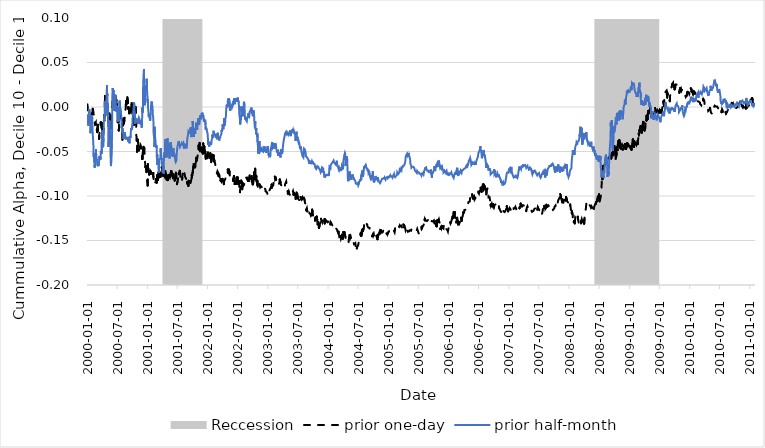
| Category | prior one-day | prior half-month |
|---|---|---|
| 2000-01-03 | 0.003 | -0.008 |
| 2000-01-04 | 0.002 | -0.008 |
| 2000-01-05 | -0.001 | -0.016 |
| 2000-01-06 | -0.013 | -0.012 |
| 2000-01-07 | -0.017 | -0.019 |
| 2000-01-10 | -0.017 | -0.021 |
| 2000-01-11 | -0.016 | -0.022 |
| 2000-01-12 | -0.013 | -0.012 |
| 2000-01-13 | -0.011 | -0.012 |
| 2000-01-14 | -0.014 | -0.002 |
| 2000-01-18 | -0.015 | -0.009 |
| 2000-01-19 | -0.015 | -0.012 |
| 2000-01-20 | -0.014 | -0.02 |
| 2000-01-21 | -0.012 | -0.029 |
| 2000-01-24 | -0.013 | -0.027 |
| 2000-01-25 | -0.012 | -0.023 |
| 2000-01-26 | -0.01 | -0.018 |
| 2000-01-27 | -0.008 | -0.019 |
| 2000-01-28 | -0.01 | -0.019 |
| 2000-01-31 | -0.007 | -0.009 |
| 2000-02-01 | -0.007 | -0.013 |
| 2000-02-02 | -0.006 | -0.02 |
| 2000-02-03 | -0.006 | -0.026 |
| 2000-02-04 | -0.002 | -0.029 |
| 2000-02-07 | -0.004 | -0.039 |
| 2000-02-08 | -0.004 | -0.042 |
| 2000-02-09 | -0.006 | -0.045 |
| 2000-02-10 | -0.009 | -0.056 |
| 2000-02-11 | -0.008 | -0.052 |
| 2000-02-14 | -0.011 | -0.062 |
| 2000-02-15 | -0.014 | -0.064 |
| 2000-02-16 | -0.017 | -0.068 |
| 2000-02-17 | -0.019 | -0.065 |
| 2000-02-18 | -0.018 | -0.067 |
| 2000-02-22 | -0.019 | -0.062 |
| 2000-02-23 | -0.017 | -0.052 |
| 2000-02-24 | -0.022 | -0.047 |
| 2000-02-25 | -0.022 | -0.054 |
| 2000-02-28 | -0.02 | -0.06 |
| 2000-02-29 | -0.026 | -0.06 |
| 2000-03-01 | -0.025 | -0.058 |
| 2000-03-02 | -0.028 | -0.06 |
| 2000-03-03 | -0.026 | -0.061 |
| 2000-03-06 | -0.02 | -0.067 |
| 2000-03-07 | -0.03 | -0.065 |
| 2000-03-08 | -0.03 | -0.065 |
| 2000-03-09 | -0.03 | -0.064 |
| 2000-03-10 | -0.031 | -0.066 |
| 2000-03-13 | -0.031 | -0.063 |
| 2000-03-14 | -0.036 | -0.061 |
| 2000-03-15 | -0.032 | -0.061 |
| 2000-03-16 | -0.033 | -0.055 |
| 2000-03-17 | -0.024 | -0.059 |
| 2000-03-20 | -0.025 | -0.056 |
| 2000-03-21 | -0.022 | -0.057 |
| 2000-03-22 | -0.019 | -0.059 |
| 2000-03-23 | -0.019 | -0.055 |
| 2000-03-24 | -0.017 | -0.049 |
| 2000-03-27 | -0.018 | -0.05 |
| 2000-03-28 | -0.018 | -0.051 |
| 2000-03-29 | -0.023 | -0.053 |
| 2000-03-30 | -0.03 | -0.039 |
| 2000-03-31 | -0.032 | -0.036 |
| 2000-04-03 | -0.022 | -0.026 |
| 2000-04-04 | -0.018 | -0.029 |
| 2000-04-05 | -0.019 | -0.039 |
| 2000-04-06 | -0.022 | -0.042 |
| 2000-04-07 | -0.031 | -0.045 |
| 2000-04-10 | -0.022 | -0.035 |
| 2000-04-11 | -0.019 | -0.025 |
| 2000-04-12 | -0.013 | -0.014 |
| 2000-04-13 | -0.013 | -0.016 |
| 2000-04-14 | -0.015 | -0.012 |
| 2000-04-17 | -0.002 | -0.008 |
| 2000-04-18 | 0.012 | 0.006 |
| 2000-04-19 | 0.009 | 0.002 |
| 2000-04-20 | 0.001 | 0.001 |
| 2000-04-24 | -0.007 | -0.009 |
| 2000-04-25 | 0.005 | 0.002 |
| 2000-04-26 | 0.003 | 0.004 |
| 2000-04-27 | 0.009 | 0.009 |
| 2000-04-28 | 0.016 | 0.013 |
| 2000-05-01 | 0.02 | 0.025 |
| 2000-05-02 | 0.01 | 0.003 |
| 2000-05-03 | 0.006 | -0.005 |
| 2000-05-04 | 0.003 | 0 |
| 2000-05-05 | -0.001 | 0.004 |
| 2000-05-08 | -0.007 | -0.011 |
| 2000-05-09 | -0.012 | -0.023 |
| 2000-05-10 | -0.021 | -0.045 |
| 2000-05-11 | -0.02 | -0.037 |
| 2000-05-12 | -0.014 | -0.028 |
| 2000-05-15 | -0.007 | -0.026 |
| 2000-05-16 | -0.007 | -0.015 |
| 2000-05-17 | -0.01 | -0.017 |
| 2000-05-18 | -0.009 | -0.024 |
| 2000-05-19 | -0.016 | -0.036 |
| 2000-05-22 | -0.02 | -0.043 |
| 2000-05-23 | -0.024 | -0.062 |
| 2000-05-24 | -0.023 | -0.062 |
| 2000-05-25 | -0.015 | -0.066 |
| 2000-05-26 | -0.016 | -0.066 |
| 2000-05-30 | -0.007 | -0.041 |
| 2000-05-31 | -0.002 | -0.036 |
| 2000-06-01 | 0.002 | -0.021 |
| 2000-06-02 | 0.007 | 0.013 |
| 2000-06-05 | 0.006 | 0.021 |
| 2000-06-06 | 0.007 | 0.014 |
| 2000-06-07 | 0.01 | 0.016 |
| 2000-06-08 | 0.01 | 0.015 |
| 2000-06-09 | 0.006 | 0.019 |
| 2000-06-12 | 0.01 | 0.005 |
| 2000-06-13 | 0.012 | 0.005 |
| 2000-06-14 | 0.01 | -0.004 |
| 2000-06-15 | 0.003 | -0.005 |
| 2000-06-16 | -0.003 | -0.004 |
| 2000-06-19 | 0.009 | 0.012 |
| 2000-06-20 | 0.011 | 0.014 |
| 2000-06-21 | 0.012 | 0.015 |
| 2000-06-22 | 0.009 | 0.008 |
| 2000-06-23 | 0.004 | -0.001 |
| 2000-06-26 | 0.008 | 0 |
| 2000-06-27 | 0.001 | -0.005 |
| 2000-06-28 | 0.003 | 0.001 |
| 2000-06-29 | -0.002 | -0.004 |
| 2000-06-30 | -0.002 | -0.006 |
| 2000-07-03 | -0.004 | -0.004 |
| 2000-07-05 | -0.017 | -0.017 |
| 2000-07-06 | -0.015 | -0.014 |
| 2000-07-07 | -0.011 | -0.004 |
| 2000-07-10 | -0.019 | -0.005 |
| 2000-07-11 | -0.026 | -0.014 |
| 2000-07-12 | -0.024 | -0.009 |
| 2000-07-13 | -0.016 | -0.002 |
| 2000-07-14 | -0.01 | 0.006 |
| 2000-07-17 | -0.008 | 0.007 |
| 2000-07-18 | -0.012 | 0.004 |
| 2000-07-19 | -0.012 | 0 |
| 2000-07-20 | -0.007 | 0.001 |
| 2000-07-21 | -0.009 | 0 |
| 2000-07-24 | -0.011 | -0.004 |
| 2000-07-25 | -0.01 | -0.004 |
| 2000-07-26 | -0.013 | -0.01 |
| 2000-07-27 | -0.016 | -0.017 |
| 2000-07-28 | -0.021 | -0.024 |
| 2000-07-31 | -0.024 | -0.023 |
| 2000-08-01 | -0.031 | -0.025 |
| 2000-08-02 | -0.037 | -0.029 |
| 2000-08-03 | -0.027 | -0.024 |
| 2000-08-04 | -0.023 | -0.028 |
| 2000-08-07 | -0.018 | -0.03 |
| 2000-08-08 | -0.013 | -0.029 |
| 2000-08-09 | -0.014 | -0.036 |
| 2000-08-10 | -0.017 | -0.036 |
| 2000-08-11 | -0.019 | -0.037 |
| 2000-08-14 | -0.016 | -0.033 |
| 2000-08-15 | -0.014 | -0.028 |
| 2000-08-16 | -0.015 | -0.031 |
| 2000-08-17 | -0.009 | -0.029 |
| 2000-08-18 | -0.006 | -0.03 |
| 2000-08-21 | -0.005 | -0.034 |
| 2000-08-22 | -0.002 | -0.034 |
| 2000-08-23 | 0.003 | -0.036 |
| 2000-08-24 | 0.007 | -0.036 |
| 2000-08-25 | 0.002 | -0.034 |
| 2000-08-28 | 0.005 | -0.033 |
| 2000-08-29 | 0.005 | -0.034 |
| 2000-08-30 | 0.004 | -0.034 |
| 2000-08-31 | 0.01 | -0.034 |
| 2000-09-01 | 0.011 | -0.034 |
| 2000-09-05 | 0.006 | -0.034 |
| 2000-09-06 | -0.002 | -0.033 |
| 2000-09-07 | 0 | -0.039 |
| 2000-09-08 | -0.002 | -0.038 |
| 2000-09-11 | -0.003 | -0.034 |
| 2000-09-12 | -0.007 | -0.036 |
| 2000-09-13 | -0.008 | -0.038 |
| 2000-09-14 | -0.007 | -0.041 |
| 2000-09-15 | -0.003 | -0.036 |
| 2000-09-18 | -0.002 | -0.033 |
| 2000-09-19 | -0.005 | -0.032 |
| 2000-09-20 | -0.003 | -0.035 |
| 2000-09-21 | -0.004 | -0.032 |
| 2000-09-22 | -0.005 | -0.028 |
| 2000-09-25 | -0.002 | -0.024 |
| 2000-09-26 | 0.003 | -0.025 |
| 2000-09-27 | 0.004 | -0.024 |
| 2000-09-28 | -0.003 | -0.025 |
| 2000-09-29 | -0.001 | -0.025 |
| 2000-10-02 | -0.006 | -0.02 |
| 2000-10-03 | -0.008 | -0.012 |
| 2000-10-04 | -0.004 | -0.013 |
| 2000-10-05 | -0.007 | -0.009 |
| 2000-10-06 | -0.011 | -0.007 |
| 2000-10-09 | -0.012 | -0.007 |
| 2000-10-10 | -0.015 | 0 |
| 2000-10-11 | -0.02 | -0.001 |
| 2000-10-12 | -0.018 | 0.005 |
| 2000-10-13 | -0.011 | -0.003 |
| 2000-10-16 | -0.01 | -0.006 |
| 2000-10-17 | -0.012 | -0.008 |
| 2000-10-18 | -0.019 | -0.012 |
| 2000-10-19 | -0.011 | -0.019 |
| 2000-10-20 | 0 | -0.013 |
| 2000-10-23 | -0.006 | -0.014 |
| 2000-10-24 | -0.014 | -0.015 |
| 2000-10-25 | -0.032 | -0.014 |
| 2000-10-26 | -0.033 | -0.015 |
| 2000-10-27 | -0.038 | -0.015 |
| 2000-10-30 | -0.05 | -0.017 |
| 2000-10-31 | -0.042 | -0.016 |
| 2000-11-01 | -0.037 | -0.013 |
| 2000-11-02 | -0.039 | -0.015 |
| 2000-11-03 | -0.037 | -0.018 |
| 2000-11-06 | -0.041 | -0.019 |
| 2000-11-07 | -0.041 | -0.019 |
| 2000-11-08 | -0.046 | -0.013 |
| 2000-11-09 | -0.045 | -0.014 |
| 2000-11-10 | -0.049 | -0.012 |
| 2000-11-13 | -0.047 | -0.013 |
| 2000-11-14 | -0.045 | -0.019 |
| 2000-11-15 | -0.046 | -0.016 |
| 2000-11-16 | -0.046 | -0.017 |
| 2000-11-17 | -0.047 | -0.015 |
| 2000-11-20 | -0.043 | -0.016 |
| 2000-11-21 | -0.044 | -0.017 |
| 2000-11-22 | -0.043 | -0.019 |
| 2000-11-24 | -0.046 | -0.017 |
| 2000-11-27 | -0.054 | -0.018 |
| 2000-11-28 | -0.055 | -0.023 |
| 2000-11-29 | -0.058 | -0.017 |
| 2000-11-30 | -0.056 | -0.01 |
| 2000-12-01 | -0.058 | -0.001 |
| 2000-12-04 | -0.051 | -0.006 |
| 2000-12-05 | -0.052 | 0.019 |
| 2000-12-06 | -0.047 | 0.019 |
| 2000-12-07 | -0.046 | 0.019 |
| 2000-12-08 | -0.045 | 0.036 |
| 2000-12-11 | -0.049 | 0.043 |
| 2000-12-12 | -0.046 | 0.029 |
| 2000-12-13 | -0.051 | 0.011 |
| 2000-12-14 | -0.052 | 0.002 |
| 2000-12-15 | -0.053 | 0.003 |
| 2000-12-18 | -0.064 | 0.005 |
| 2000-12-19 | -0.066 | 0.011 |
| 2000-12-20 | -0.068 | 0.013 |
| 2000-12-21 | -0.067 | 0.013 |
| 2000-12-22 | -0.067 | 0.023 |
| 2000-12-26 | -0.074 | 0.025 |
| 2000-12-27 | -0.075 | 0.028 |
| 2000-12-28 | -0.079 | 0.032 |
| 2000-12-29 | -0.08 | 0.021 |
| 2001-01-02 | -0.088 | 0.007 |
| 2001-01-03 | -0.072 | 0.009 |
| 2001-01-04 | -0.064 | 0.001 |
| 2001-01-05 | -0.068 | -0.002 |
| 2001-01-08 | -0.069 | -0.002 |
| 2001-01-09 | -0.073 | -0.011 |
| 2001-01-10 | -0.076 | -0.009 |
| 2001-01-11 | -0.072 | -0.007 |
| 2001-01-12 | -0.076 | -0.01 |
| 2001-01-16 | -0.072 | -0.009 |
| 2001-01-17 | -0.072 | -0.015 |
| 2001-01-18 | -0.075 | -0.015 |
| 2001-01-19 | -0.072 | -0.013 |
| 2001-01-22 | -0.073 | -0.002 |
| 2001-01-23 | -0.073 | 0 |
| 2001-01-24 | -0.078 | -0.002 |
| 2001-01-25 | -0.078 | 0.004 |
| 2001-01-26 | -0.078 | 0.006 |
| 2001-01-29 | -0.079 | 0.003 |
| 2001-01-30 | -0.078 | 0.002 |
| 2001-01-31 | -0.08 | 0.003 |
| 2001-02-01 | -0.076 | 0 |
| 2001-02-02 | -0.076 | -0.008 |
| 2001-02-05 | -0.074 | -0.012 |
| 2001-02-06 | -0.079 | -0.016 |
| 2001-02-07 | -0.081 | -0.028 |
| 2001-02-08 | -0.084 | -0.031 |
| 2001-02-09 | -0.084 | -0.032 |
| 2001-02-12 | -0.087 | -0.037 |
| 2001-02-13 | -0.088 | -0.045 |
| 2001-02-14 | -0.087 | -0.03 |
| 2001-02-15 | -0.087 | -0.022 |
| 2001-02-16 | -0.085 | -0.033 |
| 2001-02-20 | -0.084 | -0.042 |
| 2001-02-21 | -0.081 | -0.042 |
| 2001-02-22 | -0.081 | -0.046 |
| 2001-02-23 | -0.083 | -0.043 |
| 2001-02-26 | -0.085 | -0.046 |
| 2001-02-27 | -0.082 | -0.056 |
| 2001-02-28 | -0.079 | -0.061 |
| 2001-03-01 | -0.081 | -0.053 |
| 2001-03-02 | -0.077 | -0.065 |
| 2001-03-05 | -0.077 | -0.063 |
| 2001-03-06 | -0.082 | -0.058 |
| 2001-03-07 | -0.08 | -0.058 |
| 2001-03-08 | -0.078 | -0.063 |
| 2001-03-09 | -0.073 | -0.069 |
| 2001-03-12 | -0.073 | -0.074 |
| 2001-03-13 | -0.079 | -0.06 |
| 2001-03-14 | -0.077 | -0.06 |
| 2001-03-15 | -0.075 | -0.06 |
| 2001-03-16 | -0.074 | -0.06 |
| 2001-03-19 | -0.075 | -0.058 |
| 2001-03-20 | -0.077 | -0.059 |
| 2001-03-21 | -0.078 | -0.055 |
| 2001-03-22 | -0.08 | -0.046 |
| 2001-03-23 | -0.075 | -0.05 |
| 2001-03-26 | -0.074 | -0.056 |
| 2001-03-27 | -0.073 | -0.059 |
| 2001-03-28 | -0.071 | -0.057 |
| 2001-03-29 | -0.067 | -0.06 |
| 2001-03-30 | -0.071 | -0.064 |
| 2001-04-02 | -0.072 | -0.064 |
| 2001-04-03 | -0.07 | -0.068 |
| 2001-04-04 | -0.074 | -0.074 |
| 2001-04-05 | -0.077 | -0.065 |
| 2001-04-06 | -0.073 | -0.07 |
| 2001-04-09 | -0.074 | -0.075 |
| 2001-04-10 | -0.077 | -0.066 |
| 2001-04-11 | -0.077 | -0.055 |
| 2001-04-12 | -0.076 | -0.051 |
| 2001-04-16 | -0.077 | -0.057 |
| 2001-04-17 | -0.079 | -0.057 |
| 2001-04-18 | -0.074 | -0.04 |
| 2001-04-19 | -0.072 | -0.036 |
| 2001-04-20 | -0.072 | -0.038 |
| 2001-04-23 | -0.077 | -0.048 |
| 2001-04-24 | -0.077 | -0.051 |
| 2001-04-25 | -0.076 | -0.056 |
| 2001-04-26 | -0.078 | -0.057 |
| 2001-04-27 | -0.077 | -0.053 |
| 2001-04-30 | -0.08 | -0.055 |
| 2001-05-01 | -0.082 | -0.051 |
| 2001-05-02 | -0.082 | -0.035 |
| 2001-05-03 | -0.077 | -0.04 |
| 2001-05-04 | -0.082 | -0.043 |
| 2001-05-07 | -0.079 | -0.043 |
| 2001-05-08 | -0.08 | -0.041 |
| 2001-05-09 | -0.08 | -0.05 |
| 2001-05-10 | -0.076 | -0.049 |
| 2001-05-11 | -0.075 | -0.048 |
| 2001-05-14 | -0.076 | -0.055 |
| 2001-05-15 | -0.077 | -0.058 |
| 2001-05-16 | -0.079 | -0.05 |
| 2001-05-17 | -0.077 | -0.045 |
| 2001-05-18 | -0.079 | -0.05 |
| 2001-05-21 | -0.077 | -0.04 |
| 2001-05-22 | -0.074 | -0.039 |
| 2001-05-23 | -0.076 | -0.041 |
| 2001-05-24 | -0.074 | -0.041 |
| 2001-05-25 | -0.072 | -0.042 |
| 2001-05-29 | -0.075 | -0.048 |
| 2001-05-30 | -0.077 | -0.055 |
| 2001-05-31 | -0.077 | -0.054 |
| 2001-06-01 | -0.078 | -0.051 |
| 2001-06-04 | -0.08 | -0.056 |
| 2001-06-05 | -0.08 | -0.055 |
| 2001-06-06 | -0.078 | -0.05 |
| 2001-06-07 | -0.075 | -0.046 |
| 2001-06-08 | -0.077 | -0.05 |
| 2001-06-11 | -0.077 | -0.052 |
| 2001-06-12 | -0.078 | -0.055 |
| 2001-06-13 | -0.081 | -0.053 |
| 2001-06-14 | -0.082 | -0.055 |
| 2001-06-15 | -0.083 | -0.056 |
| 2001-06-18 | -0.08 | -0.058 |
| 2001-06-19 | -0.078 | -0.06 |
| 2001-06-20 | -0.079 | -0.06 |
| 2001-06-21 | -0.075 | -0.062 |
| 2001-06-22 | -0.074 | -0.062 |
| 2001-06-25 | -0.075 | -0.061 |
| 2001-06-26 | -0.078 | -0.06 |
| 2001-06-27 | -0.08 | -0.054 |
| 2001-06-28 | -0.081 | -0.053 |
| 2001-06-29 | -0.087 | -0.049 |
| 2001-07-02 | -0.084 | -0.044 |
| 2001-07-03 | -0.085 | -0.043 |
| 2001-07-05 | -0.081 | -0.042 |
| 2001-07-06 | -0.077 | -0.041 |
| 2001-07-09 | -0.076 | -0.041 |
| 2001-07-10 | -0.074 | -0.038 |
| 2001-07-11 | -0.075 | -0.04 |
| 2001-07-12 | -0.076 | -0.042 |
| 2001-07-13 | -0.075 | -0.043 |
| 2001-07-16 | -0.072 | -0.041 |
| 2001-07-17 | -0.074 | -0.045 |
| 2001-07-18 | -0.074 | -0.044 |
| 2001-07-19 | -0.075 | -0.046 |
| 2001-07-20 | -0.079 | -0.043 |
| 2001-07-23 | -0.079 | -0.042 |
| 2001-07-24 | -0.077 | -0.043 |
| 2001-07-25 | -0.077 | -0.041 |
| 2001-07-26 | -0.079 | -0.041 |
| 2001-07-27 | -0.081 | -0.041 |
| 2001-07-30 | -0.082 | -0.042 |
| 2001-07-31 | -0.079 | -0.043 |
| 2001-08-01 | -0.077 | -0.042 |
| 2001-08-02 | -0.073 | -0.042 |
| 2001-08-03 | -0.074 | -0.041 |
| 2001-08-06 | -0.073 | -0.04 |
| 2001-08-07 | -0.072 | -0.043 |
| 2001-08-08 | -0.071 | -0.044 |
| 2001-08-09 | -0.07 | -0.046 |
| 2001-08-10 | -0.071 | -0.047 |
| 2001-08-13 | -0.072 | -0.046 |
| 2001-08-14 | -0.075 | -0.044 |
| 2001-08-15 | -0.076 | -0.043 |
| 2001-08-16 | -0.077 | -0.042 |
| 2001-08-17 | -0.078 | -0.041 |
| 2001-08-20 | -0.077 | -0.041 |
| 2001-08-21 | -0.078 | -0.041 |
| 2001-08-22 | -0.079 | -0.042 |
| 2001-08-23 | -0.08 | -0.043 |
| 2001-08-24 | -0.081 | -0.046 |
| 2001-08-27 | -0.083 | -0.047 |
| 2001-08-28 | -0.083 | -0.043 |
| 2001-08-29 | -0.085 | -0.04 |
| 2001-08-30 | -0.086 | -0.037 |
| 2001-08-31 | -0.084 | -0.035 |
| 2001-09-04 | -0.085 | -0.031 |
| 2001-09-05 | -0.085 | -0.031 |
| 2001-09-06 | -0.088 | -0.028 |
| 2001-09-07 | -0.087 | -0.027 |
| 2001-09-10 | -0.083 | -0.029 |
| 2001-09-17 | -0.084 | -0.028 |
| 2001-09-18 | -0.085 | -0.024 |
| 2001-09-19 | -0.085 | -0.026 |
| 2001-09-20 | -0.083 | -0.024 |
| 2001-09-21 | -0.082 | -0.022 |
| 2001-09-24 | -0.082 | -0.034 |
| 2001-09-25 | -0.081 | -0.033 |
| 2001-09-26 | -0.076 | -0.031 |
| 2001-09-27 | -0.076 | -0.029 |
| 2001-09-28 | -0.079 | -0.025 |
| 2001-10-01 | -0.074 | -0.027 |
| 2001-10-02 | -0.074 | -0.026 |
| 2001-10-03 | -0.072 | -0.016 |
| 2001-10-04 | -0.073 | -0.025 |
| 2001-10-05 | -0.068 | -0.026 |
| 2001-10-08 | -0.064 | -0.025 |
| 2001-10-09 | -0.068 | -0.034 |
| 2001-10-10 | -0.068 | -0.034 |
| 2001-10-11 | -0.068 | -0.027 |
| 2001-10-12 | -0.065 | -0.028 |
| 2001-10-15 | -0.066 | -0.024 |
| 2001-10-16 | -0.065 | -0.025 |
| 2001-10-17 | -0.068 | -0.03 |
| 2001-10-18 | -0.065 | -0.026 |
| 2001-10-19 | -0.065 | -0.026 |
| 2001-10-22 | -0.061 | -0.02 |
| 2001-10-23 | -0.057 | -0.018 |
| 2001-10-24 | -0.061 | -0.02 |
| 2001-10-25 | -0.06 | -0.022 |
| 2001-10-26 | -0.06 | -0.024 |
| 2001-10-29 | -0.058 | -0.026 |
| 2001-10-30 | -0.058 | -0.023 |
| 2001-10-31 | -0.058 | -0.022 |
| 2001-11-01 | -0.055 | -0.021 |
| 2001-11-02 | -0.053 | -0.017 |
| 2001-11-05 | -0.051 | -0.014 |
| 2001-11-06 | -0.048 | -0.012 |
| 2001-11-07 | -0.043 | -0.014 |
| 2001-11-08 | -0.048 | -0.018 |
| 2001-11-09 | -0.046 | -0.02 |
| 2001-11-12 | -0.044 | -0.018 |
| 2001-11-13 | -0.04 | -0.018 |
| 2001-11-14 | -0.042 | -0.015 |
| 2001-11-15 | -0.046 | -0.011 |
| 2001-11-16 | -0.05 | -0.012 |
| 2001-11-19 | -0.046 | -0.009 |
| 2001-11-20 | -0.049 | -0.014 |
| 2001-11-21 | -0.05 | -0.011 |
| 2001-11-23 | -0.048 | -0.012 |
| 2001-11-26 | -0.046 | -0.007 |
| 2001-11-27 | -0.046 | -0.007 |
| 2001-11-28 | -0.051 | -0.009 |
| 2001-11-29 | -0.047 | -0.006 |
| 2001-11-30 | -0.048 | -0.006 |
| 2001-12-03 | -0.052 | -0.011 |
| 2001-12-04 | -0.049 | -0.011 |
| 2001-12-05 | -0.041 | -0.009 |
| 2001-12-06 | -0.041 | -0.009 |
| 2001-12-07 | -0.045 | -0.014 |
| 2001-12-10 | -0.047 | -0.017 |
| 2001-12-11 | -0.044 | -0.014 |
| 2001-12-12 | -0.043 | -0.013 |
| 2001-12-13 | -0.049 | -0.017 |
| 2001-12-14 | -0.052 | -0.018 |
| 2001-12-17 | -0.05 | -0.015 |
| 2001-12-18 | -0.049 | -0.016 |
| 2001-12-19 | -0.052 | -0.02 |
| 2001-12-20 | -0.058 | -0.025 |
| 2001-12-21 | -0.054 | -0.023 |
| 2001-12-24 | -0.054 | -0.023 |
| 2001-12-26 | -0.054 | -0.025 |
| 2001-12-27 | -0.055 | -0.027 |
| 2001-12-28 | -0.055 | -0.026 |
| 2001-12-31 | -0.057 | -0.029 |
| 2002-01-02 | -0.055 | -0.033 |
| 2002-01-03 | -0.051 | -0.041 |
| 2002-01-04 | -0.05 | -0.043 |
| 2002-01-07 | -0.05 | -0.04 |
| 2002-01-08 | -0.05 | -0.042 |
| 2002-01-09 | -0.048 | -0.043 |
| 2002-01-10 | -0.05 | -0.045 |
| 2002-01-11 | -0.051 | -0.042 |
| 2002-01-14 | -0.052 | -0.039 |
| 2002-01-15 | -0.051 | -0.042 |
| 2002-01-16 | -0.057 | -0.041 |
| 2002-01-17 | -0.052 | -0.042 |
| 2002-01-18 | -0.056 | -0.042 |
| 2002-01-22 | -0.062 | -0.042 |
| 2002-01-23 | -0.06 | -0.041 |
| 2002-01-24 | -0.056 | -0.041 |
| 2002-01-25 | -0.058 | -0.037 |
| 2002-01-28 | -0.055 | -0.036 |
| 2002-01-29 | -0.054 | -0.031 |
| 2002-01-30 | -0.054 | -0.033 |
| 2002-01-31 | -0.054 | -0.032 |
| 2002-02-01 | -0.056 | -0.034 |
| 2002-02-04 | -0.058 | -0.032 |
| 2002-02-05 | -0.054 | -0.029 |
| 2002-02-06 | -0.055 | -0.027 |
| 2002-02-07 | -0.061 | -0.031 |
| 2002-02-08 | -0.059 | -0.032 |
| 2002-02-11 | -0.06 | -0.031 |
| 2002-02-12 | -0.061 | -0.032 |
| 2002-02-13 | -0.06 | -0.032 |
| 2002-02-14 | -0.061 | -0.031 |
| 2002-02-15 | -0.063 | -0.031 |
| 2002-02-19 | -0.068 | -0.031 |
| 2002-02-20 | -0.068 | -0.035 |
| 2002-02-21 | -0.07 | -0.03 |
| 2002-02-22 | -0.073 | -0.032 |
| 2002-02-25 | -0.072 | -0.033 |
| 2002-02-26 | -0.074 | -0.033 |
| 2002-02-27 | -0.075 | -0.036 |
| 2002-02-28 | -0.075 | -0.034 |
| 2002-03-01 | -0.072 | -0.031 |
| 2002-03-04 | -0.073 | -0.029 |
| 2002-03-05 | -0.073 | -0.029 |
| 2002-03-06 | -0.074 | -0.034 |
| 2002-03-07 | -0.077 | -0.036 |
| 2002-03-08 | -0.075 | -0.034 |
| 2002-03-11 | -0.074 | -0.036 |
| 2002-03-12 | -0.076 | -0.038 |
| 2002-03-13 | -0.077 | -0.037 |
| 2002-03-14 | -0.079 | -0.037 |
| 2002-03-15 | -0.079 | -0.036 |
| 2002-03-18 | -0.079 | -0.034 |
| 2002-03-19 | -0.08 | -0.033 |
| 2002-03-20 | -0.083 | -0.032 |
| 2002-03-21 | -0.081 | -0.033 |
| 2002-03-22 | -0.08 | -0.032 |
| 2002-03-25 | -0.082 | -0.03 |
| 2002-03-26 | -0.084 | -0.031 |
| 2002-03-27 | -0.084 | -0.026 |
| 2002-03-28 | -0.083 | -0.028 |
| 2002-04-01 | -0.081 | -0.024 |
| 2002-04-02 | -0.083 | -0.019 |
| 2002-04-03 | -0.082 | -0.022 |
| 2002-04-04 | -0.082 | -0.024 |
| 2002-04-05 | -0.084 | -0.025 |
| 2002-04-08 | -0.084 | -0.023 |
| 2002-04-09 | -0.087 | -0.024 |
| 2002-04-10 | -0.086 | -0.02 |
| 2002-04-11 | -0.083 | -0.012 |
| 2002-04-12 | -0.083 | -0.021 |
| 2002-04-15 | -0.082 | -0.018 |
| 2002-04-16 | -0.083 | -0.02 |
| 2002-04-17 | -0.083 | -0.016 |
| 2002-04-18 | -0.081 | -0.014 |
| 2002-04-19 | -0.08 | -0.013 |
| 2002-04-22 | -0.079 | -0.01 |
| 2002-04-23 | -0.079 | -0.004 |
| 2002-04-24 | -0.078 | -0.004 |
| 2002-04-25 | -0.078 | -0.004 |
| 2002-04-26 | -0.078 | 0.003 |
| 2002-04-29 | -0.079 | 0.001 |
| 2002-04-30 | -0.079 | -0.001 |
| 2002-05-01 | -0.077 | -0.001 |
| 2002-05-02 | -0.073 | 0.002 |
| 2002-05-03 | -0.07 | 0.007 |
| 2002-05-06 | -0.07 | 0.007 |
| 2002-05-07 | -0.071 | 0.01 |
| 2002-05-08 | -0.075 | 0.001 |
| 2002-05-09 | -0.073 | 0.004 |
| 2002-05-10 | -0.07 | 0.009 |
| 2002-05-13 | -0.07 | 0.006 |
| 2002-05-14 | -0.073 | 0.001 |
| 2002-05-15 | -0.078 | -0.002 |
| 2002-05-16 | -0.078 | -0.002 |
| 2002-05-17 | -0.077 | -0.004 |
| 2002-05-20 | -0.078 | -0.002 |
| 2002-05-21 | -0.079 | 0 |
| 2002-05-22 | -0.081 | 0 |
| 2002-05-23 | -0.081 | 0.002 |
| 2002-05-24 | -0.082 | 0.001 |
| 2002-05-28 | -0.082 | 0.002 |
| 2002-05-29 | -0.082 | 0 |
| 2002-05-30 | -0.082 | -0.001 |
| 2002-05-31 | -0.081 | 0.001 |
| 2002-06-03 | -0.082 | 0.002 |
| 2002-06-04 | -0.083 | 0.002 |
| 2002-06-05 | -0.081 | 0.007 |
| 2002-06-06 | -0.081 | 0.007 |
| 2002-06-07 | -0.079 | 0.005 |
| 2002-06-10 | -0.077 | 0.008 |
| 2002-06-11 | -0.081 | 0.01 |
| 2002-06-12 | -0.084 | 0.006 |
| 2002-06-13 | -0.086 | 0.005 |
| 2002-06-14 | -0.086 | 0.003 |
| 2002-06-17 | -0.084 | 0.008 |
| 2002-06-18 | -0.086 | 0.007 |
| 2002-06-19 | -0.087 | 0.01 |
| 2002-06-20 | -0.084 | 0.008 |
| 2002-06-21 | -0.084 | 0.006 |
| 2002-06-24 | -0.082 | 0.009 |
| 2002-06-25 | -0.081 | 0.006 |
| 2002-06-26 | -0.079 | 0.01 |
| 2002-06-27 | -0.08 | 0.009 |
| 2002-06-28 | -0.087 | 0.006 |
| 2002-07-01 | -0.081 | 0.009 |
| 2002-07-02 | -0.079 | 0.011 |
| 2002-07-03 | -0.082 | 0.006 |
| 2002-07-05 | -0.086 | 0.007 |
| 2002-07-08 | -0.085 | 0.005 |
| 2002-07-09 | -0.083 | 0.005 |
| 2002-07-10 | -0.084 | 0.005 |
| 2002-07-11 | -0.087 | -0.004 |
| 2002-07-12 | -0.091 | -0.008 |
| 2002-07-15 | -0.091 | -0.013 |
| 2002-07-16 | -0.096 | -0.018 |
| 2002-07-17 | -0.093 | -0.02 |
| 2002-07-18 | -0.094 | -0.019 |
| 2002-07-19 | -0.092 | -0.017 |
| 2002-07-22 | -0.089 | -0.014 |
| 2002-07-23 | -0.083 | -0.007 |
| 2002-07-24 | -0.084 | 0.001 |
| 2002-07-25 | -0.086 | -0.005 |
| 2002-07-26 | -0.084 | -0.004 |
| 2002-07-29 | -0.09 | -0.001 |
| 2002-07-30 | -0.092 | -0.007 |
| 2002-07-31 | -0.085 | -0.009 |
| 2002-08-01 | -0.089 | 0 |
| 2002-08-02 | -0.089 | -0.01 |
| 2002-08-05 | -0.088 | -0.005 |
| 2002-08-06 | -0.088 | -0.003 |
| 2002-08-07 | -0.089 | 0.001 |
| 2002-08-08 | -0.088 | 0.002 |
| 2002-08-09 | -0.087 | 0.006 |
| 2002-08-12 | -0.088 | 0.002 |
| 2002-08-13 | -0.087 | 0.003 |
| 2002-08-14 | -0.085 | -0.008 |
| 2002-08-15 | -0.085 | -0.012 |
| 2002-08-16 | -0.082 | -0.014 |
| 2002-08-19 | -0.08 | -0.012 |
| 2002-08-20 | -0.079 | -0.011 |
| 2002-08-21 | -0.078 | -0.014 |
| 2002-08-22 | -0.078 | -0.015 |
| 2002-08-23 | -0.079 | -0.015 |
| 2002-08-26 | -0.079 | -0.016 |
| 2002-08-27 | -0.081 | -0.015 |
| 2002-08-28 | -0.082 | -0.016 |
| 2002-08-29 | -0.079 | -0.012 |
| 2002-08-30 | -0.081 | -0.011 |
| 2002-09-03 | -0.082 | -0.01 |
| 2002-09-04 | -0.083 | -0.012 |
| 2002-09-05 | -0.082 | -0.007 |
| 2002-09-06 | -0.083 | -0.009 |
| 2002-09-09 | -0.08 | -0.008 |
| 2002-09-10 | -0.078 | -0.01 |
| 2002-09-11 | -0.077 | -0.008 |
| 2002-09-12 | -0.077 | -0.006 |
| 2002-09-13 | -0.077 | -0.005 |
| 2002-09-16 | -0.076 | -0.005 |
| 2002-09-17 | -0.075 | -0.004 |
| 2002-09-18 | -0.077 | -0.003 |
| 2002-09-19 | -0.079 | -0.004 |
| 2002-09-20 | -0.081 | -0.002 |
| 2002-09-23 | -0.079 | -0.001 |
| 2002-09-24 | -0.078 | 0 |
| 2002-09-25 | -0.082 | -0.007 |
| 2002-09-26 | -0.085 | -0.003 |
| 2002-09-27 | -0.085 | -0.004 |
| 2002-09-30 | -0.087 | -0.005 |
| 2002-10-01 | -0.085 | -0.01 |
| 2002-10-02 | -0.084 | -0.008 |
| 2002-10-03 | -0.087 | -0.005 |
| 2002-10-04 | -0.085 | -0.004 |
| 2002-10-07 | -0.082 | -0.004 |
| 2002-10-08 | -0.08 | -0.006 |
| 2002-10-09 | -0.073 | -0.008 |
| 2002-10-10 | -0.081 | -0.011 |
| 2002-10-11 | -0.081 | -0.016 |
| 2002-10-14 | -0.08 | -0.023 |
| 2002-10-15 | -0.076 | -0.024 |
| 2002-10-16 | -0.069 | -0.016 |
| 2002-10-17 | -0.076 | -0.024 |
| 2002-10-18 | -0.075 | -0.024 |
| 2002-10-21 | -0.081 | -0.026 |
| 2002-10-22 | -0.077 | -0.024 |
| 2002-10-23 | -0.083 | -0.031 |
| 2002-10-24 | -0.083 | -0.031 |
| 2002-10-25 | -0.085 | -0.029 |
| 2002-10-28 | -0.087 | -0.034 |
| 2002-10-29 | -0.083 | -0.029 |
| 2002-10-30 | -0.088 | -0.039 |
| 2002-10-31 | -0.089 | -0.038 |
| 2002-11-01 | -0.089 | -0.042 |
| 2002-11-04 | -0.091 | -0.052 |
| 2002-11-05 | -0.091 | -0.048 |
| 2002-11-06 | -0.092 | -0.053 |
| 2002-11-07 | -0.09 | -0.053 |
| 2002-11-08 | -0.088 | -0.046 |
| 2002-11-11 | -0.087 | -0.038 |
| 2002-11-12 | -0.088 | -0.043 |
| 2002-11-13 | -0.089 | -0.044 |
| 2002-11-14 | -0.089 | -0.045 |
| 2002-11-15 | -0.09 | -0.046 |
| 2002-11-18 | -0.089 | -0.05 |
| 2002-11-19 | -0.089 | -0.047 |
| 2002-11-20 | -0.088 | -0.049 |
| 2002-11-21 | -0.088 | -0.048 |
| 2002-11-22 | -0.09 | -0.048 |
| 2002-11-25 | -0.09 | -0.047 |
| 2002-11-26 | -0.091 | -0.047 |
| 2002-11-27 | -0.091 | -0.048 |
| 2002-11-29 | -0.092 | -0.049 |
| 2002-12-02 | -0.091 | -0.05 |
| 2002-12-03 | -0.09 | -0.047 |
| 2002-12-04 | -0.092 | -0.051 |
| 2002-12-05 | -0.092 | -0.049 |
| 2002-12-06 | -0.092 | -0.049 |
| 2002-12-09 | -0.093 | -0.044 |
| 2002-12-10 | -0.093 | -0.047 |
| 2002-12-11 | -0.093 | -0.047 |
| 2002-12-12 | -0.091 | -0.047 |
| 2002-12-13 | -0.09 | -0.045 |
| 2002-12-16 | -0.092 | -0.049 |
| 2002-12-17 | -0.093 | -0.05 |
| 2002-12-18 | -0.095 | -0.048 |
| 2002-12-19 | -0.095 | -0.047 |
| 2002-12-20 | -0.095 | -0.048 |
| 2002-12-23 | -0.094 | -0.051 |
| 2002-12-24 | -0.095 | -0.05 |
| 2002-12-26 | -0.096 | -0.049 |
| 2002-12-27 | -0.096 | -0.047 |
| 2002-12-30 | -0.098 | -0.046 |
| 2002-12-31 | -0.099 | -0.044 |
| 2003-01-02 | -0.099 | -0.049 |
| 2003-01-03 | -0.1 | -0.05 |
| 2003-01-06 | -0.098 | -0.055 |
| 2003-01-07 | -0.096 | -0.054 |
| 2003-01-08 | -0.096 | -0.052 |
| 2003-01-09 | -0.095 | -0.055 |
| 2003-01-10 | -0.094 | -0.055 |
| 2003-01-13 | -0.094 | -0.053 |
| 2003-01-14 | -0.093 | -0.056 |
| 2003-01-15 | -0.092 | -0.056 |
| 2003-01-16 | -0.092 | -0.053 |
| 2003-01-17 | -0.091 | -0.048 |
| 2003-01-21 | -0.091 | -0.045 |
| 2003-01-22 | -0.09 | -0.045 |
| 2003-01-23 | -0.091 | -0.049 |
| 2003-01-24 | -0.087 | -0.042 |
| 2003-01-27 | -0.087 | -0.039 |
| 2003-01-28 | -0.089 | -0.042 |
| 2003-01-29 | -0.089 | -0.047 |
| 2003-01-30 | -0.089 | -0.043 |
| 2003-01-31 | -0.09 | -0.043 |
| 2003-02-03 | -0.088 | -0.041 |
| 2003-02-04 | -0.083 | -0.044 |
| 2003-02-05 | -0.083 | -0.043 |
| 2003-02-06 | -0.083 | -0.043 |
| 2003-02-07 | -0.082 | -0.045 |
| 2003-02-10 | -0.083 | -0.047 |
| 2003-02-11 | -0.08 | -0.045 |
| 2003-02-12 | -0.078 | -0.041 |
| 2003-02-13 | -0.08 | -0.042 |
| 2003-02-14 | -0.082 | -0.041 |
| 2003-02-18 | -0.082 | -0.041 |
| 2003-02-19 | -0.08 | -0.043 |
| 2003-02-20 | -0.08 | -0.044 |
| 2003-02-21 | -0.083 | -0.047 |
| 2003-02-24 | -0.082 | -0.05 |
| 2003-02-25 | -0.083 | -0.05 |
| 2003-02-26 | -0.083 | -0.05 |
| 2003-02-27 | -0.083 | -0.049 |
| 2003-02-28 | -0.082 | -0.05 |
| 2003-03-03 | -0.083 | -0.049 |
| 2003-03-04 | -0.084 | -0.055 |
| 2003-03-05 | -0.084 | -0.054 |
| 2003-03-06 | -0.085 | -0.056 |
| 2003-03-07 | -0.087 | -0.051 |
| 2003-03-10 | -0.086 | -0.053 |
| 2003-03-11 | -0.086 | -0.053 |
| 2003-03-12 | -0.084 | -0.051 |
| 2003-03-13 | -0.083 | -0.05 |
| 2003-03-14 | -0.081 | -0.051 |
| 2003-03-17 | -0.081 | -0.054 |
| 2003-03-18 | -0.082 | -0.057 |
| 2003-03-19 | -0.084 | -0.052 |
| 2003-03-20 | -0.086 | -0.053 |
| 2003-03-21 | -0.087 | -0.047 |
| 2003-03-24 | -0.088 | -0.048 |
| 2003-03-25 | -0.089 | -0.05 |
| 2003-03-26 | -0.088 | -0.051 |
| 2003-03-27 | -0.09 | -0.053 |
| 2003-03-28 | -0.092 | -0.052 |
| 2003-03-31 | -0.092 | -0.05 |
| 2003-04-01 | -0.092 | -0.05 |
| 2003-04-02 | -0.091 | -0.044 |
| 2003-04-03 | -0.091 | -0.044 |
| 2003-04-04 | -0.09 | -0.042 |
| 2003-04-07 | -0.088 | -0.037 |
| 2003-04-08 | -0.088 | -0.037 |
| 2003-04-09 | -0.089 | -0.037 |
| 2003-04-10 | -0.089 | -0.035 |
| 2003-04-11 | -0.089 | -0.034 |
| 2003-04-14 | -0.088 | -0.034 |
| 2003-04-15 | -0.087 | -0.03 |
| 2003-04-16 | -0.086 | -0.03 |
| 2003-04-17 | -0.086 | -0.029 |
| 2003-04-21 | -0.085 | -0.028 |
| 2003-04-22 | -0.084 | -0.027 |
| 2003-04-23 | -0.083 | -0.027 |
| 2003-04-24 | -0.087 | -0.027 |
| 2003-04-25 | -0.09 | -0.03 |
| 2003-04-28 | -0.09 | -0.029 |
| 2003-04-29 | -0.091 | -0.029 |
| 2003-04-30 | -0.094 | -0.029 |
| 2003-05-01 | -0.095 | -0.03 |
| 2003-05-02 | -0.098 | -0.03 |
| 2003-05-05 | -0.097 | -0.032 |
| 2003-05-06 | -0.097 | -0.032 |
| 2003-05-07 | -0.095 | -0.029 |
| 2003-05-08 | -0.095 | -0.031 |
| 2003-05-09 | -0.096 | -0.03 |
| 2003-05-12 | -0.097 | -0.029 |
| 2003-05-13 | -0.098 | -0.028 |
| 2003-05-14 | -0.099 | -0.029 |
| 2003-05-15 | -0.099 | -0.028 |
| 2003-05-16 | -0.099 | -0.026 |
| 2003-05-19 | -0.099 | -0.031 |
| 2003-05-20 | -0.099 | -0.033 |
| 2003-05-21 | -0.096 | -0.031 |
| 2003-05-22 | -0.097 | -0.03 |
| 2003-05-23 | -0.096 | -0.03 |
| 2003-05-27 | -0.097 | -0.03 |
| 2003-05-28 | -0.098 | -0.028 |
| 2003-05-29 | -0.097 | -0.025 |
| 2003-05-30 | -0.098 | -0.027 |
| 2003-06-02 | -0.095 | -0.025 |
| 2003-06-03 | -0.096 | -0.025 |
| 2003-06-04 | -0.096 | -0.025 |
| 2003-06-05 | -0.098 | -0.028 |
| 2003-06-06 | -0.098 | -0.03 |
| 2003-06-09 | -0.097 | -0.028 |
| 2003-06-10 | -0.097 | -0.028 |
| 2003-06-11 | -0.097 | -0.03 |
| 2003-06-12 | -0.097 | -0.029 |
| 2003-06-13 | -0.097 | -0.029 |
| 2003-06-16 | -0.099 | -0.032 |
| 2003-06-17 | -0.101 | -0.036 |
| 2003-06-18 | -0.103 | -0.038 |
| 2003-06-19 | -0.101 | -0.033 |
| 2003-06-20 | -0.1 | -0.032 |
| 2003-06-23 | -0.098 | -0.028 |
| 2003-06-24 | -0.096 | -0.027 |
| 2003-06-25 | -0.098 | -0.03 |
| 2003-06-26 | -0.102 | -0.034 |
| 2003-06-27 | -0.102 | -0.035 |
| 2003-06-30 | -0.102 | -0.034 |
| 2003-07-01 | -0.1 | -0.035 |
| 2003-07-02 | -0.102 | -0.038 |
| 2003-07-03 | -0.103 | -0.036 |
| 2003-07-07 | -0.102 | -0.04 |
| 2003-07-08 | -0.104 | -0.042 |
| 2003-07-09 | -0.104 | -0.039 |
| 2003-07-10 | -0.105 | -0.041 |
| 2003-07-11 | -0.104 | -0.041 |
| 2003-07-14 | -0.104 | -0.046 |
| 2003-07-15 | -0.104 | -0.047 |
| 2003-07-16 | -0.105 | -0.046 |
| 2003-07-17 | -0.103 | -0.045 |
| 2003-07-18 | -0.101 | -0.044 |
| 2003-07-21 | -0.101 | -0.044 |
| 2003-07-22 | -0.102 | -0.047 |
| 2003-07-23 | -0.104 | -0.05 |
| 2003-07-24 | -0.105 | -0.05 |
| 2003-07-25 | -0.103 | -0.051 |
| 2003-07-28 | -0.102 | -0.053 |
| 2003-07-29 | -0.104 | -0.055 |
| 2003-07-30 | -0.104 | -0.055 |
| 2003-07-31 | -0.104 | -0.054 |
| 2003-08-01 | -0.104 | -0.054 |
| 2003-08-04 | -0.103 | -0.057 |
| 2003-08-05 | -0.104 | -0.055 |
| 2003-08-06 | -0.102 | -0.051 |
| 2003-08-07 | -0.102 | -0.049 |
| 2003-08-08 | -0.102 | -0.047 |
| 2003-08-11 | -0.103 | -0.046 |
| 2003-08-12 | -0.105 | -0.047 |
| 2003-08-13 | -0.107 | -0.048 |
| 2003-08-14 | -0.107 | -0.049 |
| 2003-08-15 | -0.107 | -0.049 |
| 2003-08-18 | -0.11 | -0.052 |
| 2003-08-19 | -0.113 | -0.056 |
| 2003-08-20 | -0.114 | -0.054 |
| 2003-08-21 | -0.116 | -0.056 |
| 2003-08-22 | -0.115 | -0.056 |
| 2003-08-25 | -0.114 | -0.055 |
| 2003-08-26 | -0.114 | -0.056 |
| 2003-08-27 | -0.116 | -0.057 |
| 2003-08-28 | -0.118 | -0.056 |
| 2003-08-29 | -0.118 | -0.057 |
| 2003-09-02 | -0.12 | -0.059 |
| 2003-09-03 | -0.122 | -0.059 |
| 2003-09-04 | -0.122 | -0.06 |
| 2003-09-05 | -0.121 | -0.061 |
| 2003-09-08 | -0.123 | -0.063 |
| 2003-09-09 | -0.122 | -0.064 |
| 2003-09-10 | -0.119 | -0.061 |
| 2003-09-11 | -0.12 | -0.062 |
| 2003-09-12 | -0.119 | -0.062 |
| 2003-09-15 | -0.119 | -0.062 |
| 2003-09-16 | -0.121 | -0.062 |
| 2003-09-17 | -0.12 | -0.06 |
| 2003-09-18 | -0.122 | -0.062 |
| 2003-09-19 | -0.121 | -0.064 |
| 2003-09-22 | -0.12 | -0.063 |
| 2003-09-23 | -0.122 | -0.062 |
| 2003-09-24 | -0.12 | -0.063 |
| 2003-09-25 | -0.117 | -0.061 |
| 2003-09-26 | -0.115 | -0.061 |
| 2003-09-29 | -0.117 | -0.063 |
| 2003-09-30 | -0.117 | -0.061 |
| 2003-10-01 | -0.121 | -0.064 |
| 2003-10-02 | -0.121 | -0.062 |
| 2003-10-03 | -0.124 | -0.064 |
| 2003-10-06 | -0.124 | -0.064 |
| 2003-10-07 | -0.125 | -0.064 |
| 2003-10-08 | -0.124 | -0.064 |
| 2003-10-09 | -0.125 | -0.065 |
| 2003-10-10 | -0.124 | -0.064 |
| 2003-10-13 | -0.128 | -0.066 |
| 2003-10-14 | -0.129 | -0.067 |
| 2003-10-15 | -0.125 | -0.068 |
| 2003-10-16 | -0.127 | -0.068 |
| 2003-10-17 | -0.124 | -0.069 |
| 2003-10-20 | -0.124 | -0.069 |
| 2003-10-21 | -0.126 | -0.069 |
| 2003-10-22 | -0.125 | -0.068 |
| 2003-10-23 | -0.124 | -0.069 |
| 2003-10-24 | -0.123 | -0.068 |
| 2003-10-27 | -0.127 | -0.066 |
| 2003-10-28 | -0.129 | -0.066 |
| 2003-10-29 | -0.132 | -0.067 |
| 2003-10-30 | -0.131 | -0.067 |
| 2003-10-31 | -0.129 | -0.066 |
| 2003-11-03 | -0.132 | -0.067 |
| 2003-11-04 | -0.133 | -0.067 |
| 2003-11-05 | -0.134 | -0.067 |
| 2003-11-06 | -0.136 | -0.069 |
| 2003-11-07 | -0.136 | -0.069 |
| 2003-11-10 | -0.134 | -0.069 |
| 2003-11-11 | -0.133 | -0.069 |
| 2003-11-12 | -0.134 | -0.069 |
| 2003-11-13 | -0.134 | -0.071 |
| 2003-11-14 | -0.13 | -0.072 |
| 2003-11-17 | -0.127 | -0.074 |
| 2003-11-18 | -0.127 | -0.073 |
| 2003-11-19 | -0.126 | -0.073 |
| 2003-11-20 | -0.126 | -0.072 |
| 2003-11-21 | -0.126 | -0.071 |
| 2003-11-24 | -0.129 | -0.071 |
| 2003-11-25 | -0.129 | -0.068 |
| 2003-11-26 | -0.129 | -0.068 |
| 2003-11-28 | -0.13 | -0.068 |
| 2003-12-01 | -0.131 | -0.068 |
| 2003-12-02 | -0.13 | -0.069 |
| 2003-12-03 | -0.127 | -0.072 |
| 2003-12-04 | -0.127 | -0.074 |
| 2003-12-05 | -0.127 | -0.072 |
| 2003-12-08 | -0.129 | -0.075 |
| 2003-12-09 | -0.127 | -0.077 |
| 2003-12-10 | -0.126 | -0.079 |
| 2003-12-11 | -0.129 | -0.076 |
| 2003-12-12 | -0.131 | -0.076 |
| 2003-12-15 | -0.127 | -0.077 |
| 2003-12-16 | -0.128 | -0.078 |
| 2003-12-17 | -0.129 | -0.078 |
| 2003-12-18 | -0.129 | -0.077 |
| 2003-12-19 | -0.129 | -0.077 |
| 2003-12-22 | -0.129 | -0.076 |
| 2003-12-23 | -0.13 | -0.077 |
| 2003-12-24 | -0.128 | -0.076 |
| 2003-12-26 | -0.128 | -0.075 |
| 2003-12-29 | -0.129 | -0.076 |
| 2003-12-30 | -0.129 | -0.077 |
| 2003-12-31 | -0.129 | -0.078 |
| 2004-01-02 | -0.129 | -0.075 |
| 2004-01-05 | -0.128 | -0.077 |
| 2004-01-06 | -0.129 | -0.075 |
| 2004-01-07 | -0.129 | -0.074 |
| 2004-01-08 | -0.127 | -0.071 |
| 2004-01-09 | -0.128 | -0.067 |
| 2004-01-12 | -0.128 | -0.068 |
| 2004-01-13 | -0.13 | -0.068 |
| 2004-01-14 | -0.132 | -0.068 |
| 2004-01-15 | -0.132 | -0.069 |
| 2004-01-16 | -0.129 | -0.066 |
| 2004-01-20 | -0.13 | -0.065 |
| 2004-01-21 | -0.13 | -0.064 |
| 2004-01-22 | -0.131 | -0.064 |
| 2004-01-23 | -0.131 | -0.064 |
| 2004-01-26 | -0.131 | -0.064 |
| 2004-01-27 | -0.133 | -0.064 |
| 2004-01-28 | -0.135 | -0.062 |
| 2004-01-29 | -0.135 | -0.062 |
| 2004-01-30 | -0.136 | -0.062 |
| 2004-02-02 | -0.136 | -0.062 |
| 2004-02-03 | -0.135 | -0.06 |
| 2004-02-04 | -0.135 | -0.06 |
| 2004-02-05 | -0.136 | -0.062 |
| 2004-02-06 | -0.135 | -0.062 |
| 2004-02-09 | -0.136 | -0.063 |
| 2004-02-10 | -0.136 | -0.063 |
| 2004-02-11 | -0.137 | -0.063 |
| 2004-02-12 | -0.137 | -0.063 |
| 2004-02-13 | -0.136 | -0.063 |
| 2004-02-17 | -0.136 | -0.065 |
| 2004-02-18 | -0.136 | -0.063 |
| 2004-02-19 | -0.137 | -0.063 |
| 2004-02-20 | -0.138 | -0.063 |
| 2004-02-23 | -0.137 | -0.06 |
| 2004-02-24 | -0.137 | -0.063 |
| 2004-02-25 | -0.138 | -0.064 |
| 2004-02-26 | -0.139 | -0.065 |
| 2004-02-27 | -0.14 | -0.066 |
| 2004-03-01 | -0.14 | -0.067 |
| 2004-03-02 | -0.141 | -0.067 |
| 2004-03-03 | -0.142 | -0.067 |
| 2004-03-04 | -0.14 | -0.068 |
| 2004-03-05 | -0.142 | -0.07 |
| 2004-03-08 | -0.144 | -0.068 |
| 2004-03-09 | -0.146 | -0.069 |
| 2004-03-10 | -0.147 | -0.069 |
| 2004-03-11 | -0.146 | -0.069 |
| 2004-03-12 | -0.145 | -0.071 |
| 2004-03-15 | -0.147 | -0.07 |
| 2004-03-16 | -0.146 | -0.07 |
| 2004-03-17 | -0.145 | -0.068 |
| 2004-03-18 | -0.147 | -0.069 |
| 2004-03-19 | -0.148 | -0.072 |
| 2004-03-22 | -0.149 | -0.072 |
| 2004-03-23 | -0.148 | -0.073 |
| 2004-03-24 | -0.146 | -0.069 |
| 2004-03-25 | -0.143 | -0.066 |
| 2004-03-26 | -0.146 | -0.066 |
| 2004-03-29 | -0.145 | -0.066 |
| 2004-03-30 | -0.146 | -0.068 |
| 2004-03-31 | -0.148 | -0.07 |
| 2004-04-01 | -0.144 | -0.068 |
| 2004-04-02 | -0.14 | -0.062 |
| 2004-04-05 | -0.14 | -0.058 |
| 2004-04-06 | -0.141 | -0.057 |
| 2004-04-07 | -0.143 | -0.059 |
| 2004-04-08 | -0.141 | -0.054 |
| 2004-04-12 | -0.141 | -0.052 |
| 2004-04-13 | -0.141 | -0.053 |
| 2004-04-14 | -0.141 | -0.053 |
| 2004-04-15 | -0.146 | -0.059 |
| 2004-04-16 | -0.149 | -0.066 |
| 2004-04-19 | -0.148 | -0.061 |
| 2004-04-20 | -0.148 | -0.063 |
| 2004-04-21 | -0.147 | -0.057 |
| 2004-04-22 | -0.147 | -0.059 |
| 2004-04-23 | -0.147 | -0.056 |
| 2004-04-26 | -0.149 | -0.06 |
| 2004-04-27 | -0.151 | -0.068 |
| 2004-04-28 | -0.151 | -0.071 |
| 2004-04-29 | -0.15 | -0.075 |
| 2004-04-30 | -0.152 | -0.082 |
| 2004-05-03 | -0.152 | -0.083 |
| 2004-05-04 | -0.152 | -0.08 |
| 2004-05-05 | -0.151 | -0.078 |
| 2004-05-06 | -0.151 | -0.079 |
| 2004-05-07 | -0.146 | -0.076 |
| 2004-05-10 | -0.144 | -0.076 |
| 2004-05-11 | -0.143 | -0.072 |
| 2004-05-12 | -0.144 | -0.075 |
| 2004-05-13 | -0.144 | -0.075 |
| 2004-05-14 | -0.147 | -0.08 |
| 2004-05-17 | -0.146 | -0.082 |
| 2004-05-18 | -0.146 | -0.08 |
| 2004-05-19 | -0.147 | -0.077 |
| 2004-05-20 | -0.147 | -0.078 |
| 2004-05-21 | -0.148 | -0.078 |
| 2004-05-24 | -0.15 | -0.079 |
| 2004-05-25 | -0.151 | -0.078 |
| 2004-05-26 | -0.151 | -0.077 |
| 2004-05-27 | -0.151 | -0.076 |
| 2004-05-28 | -0.152 | -0.075 |
| 2004-06-01 | -0.153 | -0.076 |
| 2004-06-02 | -0.154 | -0.079 |
| 2004-06-03 | -0.154 | -0.082 |
| 2004-06-04 | -0.153 | -0.08 |
| 2004-06-07 | -0.154 | -0.079 |
| 2004-06-08 | -0.154 | -0.079 |
| 2004-06-09 | -0.154 | -0.082 |
| 2004-06-10 | -0.154 | -0.081 |
| 2004-06-14 | -0.153 | -0.082 |
| 2004-06-15 | -0.154 | -0.084 |
| 2004-06-16 | -0.155 | -0.086 |
| 2004-06-17 | -0.157 | -0.086 |
| 2004-06-18 | -0.157 | -0.086 |
| 2004-06-21 | -0.156 | -0.086 |
| 2004-06-22 | -0.157 | -0.086 |
| 2004-06-23 | -0.159 | -0.087 |
| 2004-06-24 | -0.158 | -0.087 |
| 2004-06-25 | -0.157 | -0.086 |
| 2004-06-28 | -0.158 | -0.086 |
| 2004-06-29 | -0.157 | -0.085 |
| 2004-06-30 | -0.158 | -0.086 |
| 2004-07-01 | -0.155 | -0.087 |
| 2004-07-02 | -0.154 | -0.088 |
| 2004-07-06 | -0.151 | -0.086 |
| 2004-07-07 | -0.15 | -0.084 |
| 2004-07-08 | -0.147 | -0.084 |
| 2004-07-09 | -0.147 | -0.084 |
| 2004-07-12 | -0.145 | -0.084 |
| 2004-07-13 | -0.145 | -0.082 |
| 2004-07-14 | -0.145 | -0.083 |
| 2004-07-15 | -0.146 | -0.083 |
| 2004-07-16 | -0.142 | -0.081 |
| 2004-07-19 | -0.141 | -0.08 |
| 2004-07-20 | -0.145 | -0.081 |
| 2004-07-21 | -0.141 | -0.076 |
| 2004-07-22 | -0.143 | -0.078 |
| 2004-07-23 | -0.14 | -0.075 |
| 2004-07-26 | -0.138 | -0.071 |
| 2004-07-27 | -0.14 | -0.075 |
| 2004-07-28 | -0.138 | -0.075 |
| 2004-07-29 | -0.139 | -0.076 |
| 2004-07-30 | -0.139 | -0.078 |
| 2004-08-02 | -0.139 | -0.075 |
| 2004-08-03 | -0.137 | -0.074 |
| 2004-08-04 | -0.137 | -0.071 |
| 2004-08-05 | -0.135 | -0.069 |
| 2004-08-06 | -0.133 | -0.066 |
| 2004-08-09 | -0.133 | -0.068 |
| 2004-08-10 | -0.134 | -0.068 |
| 2004-08-11 | -0.132 | -0.067 |
| 2004-08-12 | -0.129 | -0.066 |
| 2004-08-13 | -0.13 | -0.066 |
| 2004-08-16 | -0.13 | -0.065 |
| 2004-08-17 | -0.13 | -0.065 |
| 2004-08-18 | -0.13 | -0.067 |
| 2004-08-19 | -0.131 | -0.068 |
| 2004-08-20 | -0.131 | -0.069 |
| 2004-08-23 | -0.132 | -0.068 |
| 2004-08-24 | -0.131 | -0.068 |
| 2004-08-25 | -0.132 | -0.069 |
| 2004-08-26 | -0.134 | -0.069 |
| 2004-08-27 | -0.133 | -0.071 |
| 2004-08-30 | -0.134 | -0.07 |
| 2004-08-31 | -0.134 | -0.071 |
| 2004-09-01 | -0.136 | -0.073 |
| 2004-09-02 | -0.136 | -0.074 |
| 2004-09-03 | -0.136 | -0.074 |
| 2004-09-07 | -0.135 | -0.073 |
| 2004-09-08 | -0.136 | -0.074 |
| 2004-09-09 | -0.138 | -0.074 |
| 2004-09-10 | -0.137 | -0.077 |
| 2004-09-13 | -0.138 | -0.079 |
| 2004-09-14 | -0.139 | -0.08 |
| 2004-09-15 | -0.139 | -0.079 |
| 2004-09-16 | -0.138 | -0.079 |
| 2004-09-17 | -0.14 | -0.079 |
| 2004-09-20 | -0.139 | -0.08 |
| 2004-09-21 | -0.141 | -0.08 |
| 2004-09-22 | -0.142 | -0.077 |
| 2004-09-23 | -0.143 | -0.08 |
| 2004-09-24 | -0.145 | -0.077 |
| 2004-09-27 | -0.145 | -0.074 |
| 2004-09-28 | -0.145 | -0.072 |
| 2004-09-29 | -0.143 | -0.076 |
| 2004-09-30 | -0.144 | -0.078 |
| 2004-10-01 | -0.145 | -0.081 |
| 2004-10-04 | -0.143 | -0.083 |
| 2004-10-05 | -0.144 | -0.085 |
| 2004-10-06 | -0.146 | -0.084 |
| 2004-10-07 | -0.147 | -0.084 |
| 2004-10-08 | -0.148 | -0.084 |
| 2004-10-11 | -0.147 | -0.084 |
| 2004-10-12 | -0.147 | -0.08 |
| 2004-10-13 | -0.146 | -0.079 |
| 2004-10-14 | -0.146 | -0.078 |
| 2004-10-15 | -0.145 | -0.077 |
| 2004-10-18 | -0.143 | -0.076 |
| 2004-10-19 | -0.145 | -0.078 |
| 2004-10-20 | -0.144 | -0.081 |
| 2004-10-21 | -0.146 | -0.081 |
| 2004-10-22 | -0.146 | -0.081 |
| 2004-10-25 | -0.146 | -0.082 |
| 2004-10-26 | -0.149 | -0.081 |
| 2004-10-27 | -0.146 | -0.079 |
| 2004-10-28 | -0.144 | -0.078 |
| 2004-10-29 | -0.146 | -0.08 |
| 2004-11-01 | -0.145 | -0.083 |
| 2004-11-02 | -0.143 | -0.083 |
| 2004-11-03 | -0.143 | -0.082 |
| 2004-11-04 | -0.142 | -0.084 |
| 2004-11-05 | -0.142 | -0.084 |
| 2004-11-08 | -0.14 | -0.084 |
| 2004-11-09 | -0.139 | -0.084 |
| 2004-11-10 | -0.142 | -0.085 |
| 2004-11-11 | -0.141 | -0.086 |
| 2004-11-12 | -0.141 | -0.085 |
| 2004-11-15 | -0.138 | -0.085 |
| 2004-11-16 | -0.139 | -0.084 |
| 2004-11-17 | -0.14 | -0.084 |
| 2004-11-18 | -0.141 | -0.084 |
| 2004-11-19 | -0.142 | -0.082 |
| 2004-11-22 | -0.141 | -0.081 |
| 2004-11-23 | -0.141 | -0.081 |
| 2004-11-24 | -0.141 | -0.082 |
| 2004-11-26 | -0.141 | -0.082 |
| 2004-11-29 | -0.14 | -0.082 |
| 2004-11-30 | -0.139 | -0.08 |
| 2004-12-01 | -0.138 | -0.081 |
| 2004-12-02 | -0.137 | -0.08 |
| 2004-12-03 | -0.137 | -0.08 |
| 2004-12-06 | -0.137 | -0.079 |
| 2004-12-07 | -0.136 | -0.08 |
| 2004-12-08 | -0.138 | -0.081 |
| 2004-12-09 | -0.138 | -0.08 |
| 2004-12-10 | -0.138 | -0.079 |
| 2004-12-13 | -0.14 | -0.08 |
| 2004-12-14 | -0.14 | -0.082 |
| 2004-12-15 | -0.141 | -0.082 |
| 2004-12-16 | -0.141 | -0.081 |
| 2004-12-17 | -0.141 | -0.08 |
| 2004-12-20 | -0.142 | -0.079 |
| 2004-12-21 | -0.143 | -0.08 |
| 2004-12-22 | -0.142 | -0.08 |
| 2004-12-23 | -0.142 | -0.08 |
| 2004-12-27 | -0.141 | -0.079 |
| 2004-12-28 | -0.142 | -0.08 |
| 2004-12-29 | -0.142 | -0.08 |
| 2004-12-30 | -0.142 | -0.08 |
| 2004-12-31 | -0.141 | -0.08 |
| 2005-01-03 | -0.14 | -0.08 |
| 2005-01-04 | -0.14 | -0.079 |
| 2005-01-05 | -0.138 | -0.079 |
| 2005-01-06 | -0.138 | -0.08 |
| 2005-01-07 | -0.138 | -0.079 |
| 2005-01-10 | -0.139 | -0.079 |
| 2005-01-11 | -0.139 | -0.077 |
| 2005-01-12 | -0.139 | -0.079 |
| 2005-01-13 | -0.139 | -0.077 |
| 2005-01-14 | -0.139 | -0.078 |
| 2005-01-18 | -0.138 | -0.078 |
| 2005-01-19 | -0.139 | -0.077 |
| 2005-01-20 | -0.139 | -0.078 |
| 2005-01-21 | -0.14 | -0.077 |
| 2005-01-24 | -0.141 | -0.079 |
| 2005-01-25 | -0.14 | -0.079 |
| 2005-01-26 | -0.14 | -0.079 |
| 2005-01-27 | -0.141 | -0.079 |
| 2005-01-28 | -0.14 | -0.077 |
| 2005-01-31 | -0.14 | -0.078 |
| 2005-02-01 | -0.14 | -0.077 |
| 2005-02-02 | -0.139 | -0.077 |
| 2005-02-03 | -0.138 | -0.075 |
| 2005-02-04 | -0.14 | -0.077 |
| 2005-02-07 | -0.141 | -0.078 |
| 2005-02-08 | -0.141 | -0.078 |
| 2005-02-09 | -0.138 | -0.076 |
| 2005-02-10 | -0.136 | -0.079 |
| 2005-02-11 | -0.136 | -0.079 |
| 2005-02-14 | -0.135 | -0.078 |
| 2005-02-15 | -0.136 | -0.078 |
| 2005-02-16 | -0.136 | -0.078 |
| 2005-02-17 | -0.136 | -0.077 |
| 2005-02-18 | -0.136 | -0.076 |
| 2005-02-22 | -0.135 | -0.075 |
| 2005-02-23 | -0.134 | -0.074 |
| 2005-02-24 | -0.133 | -0.072 |
| 2005-02-25 | -0.133 | -0.073 |
| 2005-02-28 | -0.135 | -0.075 |
| 2005-03-01 | -0.136 | -0.076 |
| 2005-03-02 | -0.136 | -0.075 |
| 2005-03-03 | -0.136 | -0.075 |
| 2005-03-04 | -0.135 | -0.075 |
| 2005-03-07 | -0.134 | -0.074 |
| 2005-03-08 | -0.134 | -0.072 |
| 2005-03-09 | -0.133 | -0.072 |
| 2005-03-10 | -0.133 | -0.07 |
| 2005-03-11 | -0.134 | -0.07 |
| 2005-03-14 | -0.135 | -0.071 |
| 2005-03-15 | -0.135 | -0.071 |
| 2005-03-16 | -0.134 | -0.072 |
| 2005-03-17 | -0.134 | -0.07 |
| 2005-03-18 | -0.133 | -0.069 |
| 2005-03-21 | -0.133 | -0.071 |
| 2005-03-22 | -0.132 | -0.071 |
| 2005-03-23 | -0.135 | -0.067 |
| 2005-03-24 | -0.135 | -0.069 |
| 2005-03-28 | -0.135 | -0.069 |
| 2005-03-29 | -0.137 | -0.066 |
| 2005-03-30 | -0.137 | -0.066 |
| 2005-03-31 | -0.135 | -0.065 |
| 2005-04-01 | -0.132 | -0.066 |
| 2005-04-04 | -0.133 | -0.066 |
| 2005-04-05 | -0.135 | -0.066 |
| 2005-04-06 | -0.133 | -0.066 |
| 2005-04-07 | -0.134 | -0.066 |
| 2005-04-08 | -0.134 | -0.065 |
| 2005-04-11 | -0.134 | -0.063 |
| 2005-04-12 | -0.136 | -0.062 |
| 2005-04-13 | -0.137 | -0.061 |
| 2005-04-14 | -0.137 | -0.06 |
| 2005-04-15 | -0.139 | -0.056 |
| 2005-04-18 | -0.138 | -0.055 |
| 2005-04-19 | -0.136 | -0.054 |
| 2005-04-20 | -0.136 | -0.056 |
| 2005-04-21 | -0.136 | -0.057 |
| 2005-04-22 | -0.134 | -0.054 |
| 2005-04-25 | -0.135 | -0.053 |
| 2005-04-26 | -0.134 | -0.052 |
| 2005-04-27 | -0.138 | -0.054 |
| 2005-04-28 | -0.139 | -0.053 |
| 2005-04-29 | -0.14 | -0.053 |
| 2005-05-02 | -0.14 | -0.052 |
| 2005-05-03 | -0.14 | -0.054 |
| 2005-05-04 | -0.14 | -0.056 |
| 2005-05-05 | -0.14 | -0.055 |
| 2005-05-06 | -0.14 | -0.055 |
| 2005-05-09 | -0.14 | -0.055 |
| 2005-05-10 | -0.139 | -0.054 |
| 2005-05-11 | -0.138 | -0.055 |
| 2005-05-12 | -0.14 | -0.059 |
| 2005-05-13 | -0.139 | -0.063 |
| 2005-05-16 | -0.139 | -0.065 |
| 2005-05-17 | -0.139 | -0.064 |
| 2005-05-18 | -0.139 | -0.066 |
| 2005-05-19 | -0.138 | -0.067 |
| 2005-05-20 | -0.138 | -0.068 |
| 2005-05-23 | -0.137 | -0.068 |
| 2005-05-24 | -0.137 | -0.068 |
| 2005-05-25 | -0.136 | -0.067 |
| 2005-05-26 | -0.136 | -0.068 |
| 2005-05-27 | -0.137 | -0.067 |
| 2005-05-31 | -0.136 | -0.067 |
| 2005-06-01 | -0.136 | -0.067 |
| 2005-06-02 | -0.137 | -0.068 |
| 2005-06-03 | -0.138 | -0.067 |
| 2005-06-06 | -0.138 | -0.068 |
| 2005-06-07 | -0.137 | -0.069 |
| 2005-06-08 | -0.137 | -0.069 |
| 2005-06-09 | -0.137 | -0.071 |
| 2005-06-10 | -0.138 | -0.071 |
| 2005-06-13 | -0.139 | -0.071 |
| 2005-06-14 | -0.139 | -0.071 |
| 2005-06-15 | -0.139 | -0.072 |
| 2005-06-16 | -0.138 | -0.073 |
| 2005-06-17 | -0.137 | -0.073 |
| 2005-06-20 | -0.138 | -0.073 |
| 2005-06-21 | -0.139 | -0.073 |
| 2005-06-22 | -0.138 | -0.074 |
| 2005-06-23 | -0.138 | -0.073 |
| 2005-06-24 | -0.137 | -0.072 |
| 2005-06-27 | -0.138 | -0.071 |
| 2005-06-28 | -0.139 | -0.072 |
| 2005-06-29 | -0.14 | -0.073 |
| 2005-06-30 | -0.141 | -0.074 |
| 2005-07-01 | -0.141 | -0.074 |
| 2005-07-05 | -0.143 | -0.074 |
| 2005-07-06 | -0.141 | -0.074 |
| 2005-07-07 | -0.141 | -0.073 |
| 2005-07-08 | -0.141 | -0.075 |
| 2005-07-11 | -0.141 | -0.076 |
| 2005-07-12 | -0.141 | -0.076 |
| 2005-07-13 | -0.139 | -0.076 |
| 2005-07-14 | -0.137 | -0.075 |
| 2005-07-15 | -0.137 | -0.076 |
| 2005-07-18 | -0.137 | -0.075 |
| 2005-07-19 | -0.138 | -0.077 |
| 2005-07-20 | -0.138 | -0.076 |
| 2005-07-21 | -0.134 | -0.075 |
| 2005-07-22 | -0.136 | -0.076 |
| 2005-07-25 | -0.136 | -0.074 |
| 2005-07-26 | -0.136 | -0.075 |
| 2005-07-27 | -0.135 | -0.075 |
| 2005-07-28 | -0.135 | -0.075 |
| 2005-07-29 | -0.135 | -0.075 |
| 2005-08-01 | -0.134 | -0.076 |
| 2005-08-02 | -0.132 | -0.077 |
| 2005-08-03 | -0.133 | -0.076 |
| 2005-08-04 | -0.131 | -0.074 |
| 2005-08-05 | -0.128 | -0.072 |
| 2005-08-08 | -0.126 | -0.071 |
| 2005-08-09 | -0.127 | -0.07 |
| 2005-08-10 | -0.126 | -0.069 |
| 2005-08-11 | -0.127 | -0.069 |
| 2005-08-12 | -0.126 | -0.068 |
| 2005-08-15 | -0.128 | -0.069 |
| 2005-08-16 | -0.128 | -0.07 |
| 2005-08-17 | -0.128 | -0.068 |
| 2005-08-18 | -0.127 | -0.069 |
| 2005-08-19 | -0.127 | -0.07 |
| 2005-08-22 | -0.128 | -0.071 |
| 2005-08-23 | -0.128 | -0.072 |
| 2005-08-24 | -0.127 | -0.072 |
| 2005-08-25 | -0.128 | -0.072 |
| 2005-08-26 | -0.128 | -0.071 |
| 2005-08-29 | -0.127 | -0.071 |
| 2005-08-30 | -0.126 | -0.072 |
| 2005-08-31 | -0.125 | -0.072 |
| 2005-09-01 | -0.125 | -0.073 |
| 2005-09-02 | -0.126 | -0.073 |
| 2005-09-06 | -0.127 | -0.074 |
| 2005-09-07 | -0.127 | -0.073 |
| 2005-09-08 | -0.127 | -0.072 |
| 2005-09-09 | -0.127 | -0.071 |
| 2005-09-12 | -0.128 | -0.073 |
| 2005-09-13 | -0.128 | -0.073 |
| 2005-09-14 | -0.128 | -0.072 |
| 2005-09-15 | -0.127 | -0.07 |
| 2005-09-16 | -0.127 | -0.072 |
| 2005-09-19 | -0.127 | -0.076 |
| 2005-09-20 | -0.128 | -0.077 |
| 2005-09-21 | -0.127 | -0.08 |
| 2005-09-22 | -0.128 | -0.076 |
| 2005-09-23 | -0.128 | -0.073 |
| 2005-09-26 | -0.129 | -0.075 |
| 2005-09-27 | -0.129 | -0.073 |
| 2005-09-28 | -0.128 | -0.074 |
| 2005-09-29 | -0.128 | -0.074 |
| 2005-09-30 | -0.129 | -0.073 |
| 2005-10-03 | -0.128 | -0.072 |
| 2005-10-04 | -0.129 | -0.071 |
| 2005-10-05 | -0.13 | -0.069 |
| 2005-10-06 | -0.13 | -0.066 |
| 2005-10-07 | -0.131 | -0.068 |
| 2005-10-10 | -0.132 | -0.069 |
| 2005-10-11 | -0.132 | -0.072 |
| 2005-10-12 | -0.13 | -0.071 |
| 2005-10-13 | -0.13 | -0.068 |
| 2005-10-14 | -0.131 | -0.068 |
| 2005-10-17 | -0.128 | -0.066 |
| 2005-10-18 | -0.134 | -0.068 |
| 2005-10-19 | -0.132 | -0.065 |
| 2005-10-20 | -0.134 | -0.066 |
| 2005-10-21 | -0.133 | -0.064 |
| 2005-10-24 | -0.13 | -0.063 |
| 2005-10-25 | -0.127 | -0.063 |
| 2005-10-26 | -0.126 | -0.065 |
| 2005-10-27 | -0.129 | -0.067 |
| 2005-10-28 | -0.128 | -0.065 |
| 2005-10-31 | -0.128 | -0.064 |
| 2005-11-01 | -0.128 | -0.063 |
| 2005-11-02 | -0.126 | -0.064 |
| 2005-11-03 | -0.125 | -0.06 |
| 2005-11-04 | -0.128 | -0.063 |
| 2005-11-07 | -0.13 | -0.065 |
| 2005-11-08 | -0.13 | -0.064 |
| 2005-11-09 | -0.132 | -0.065 |
| 2005-11-10 | -0.137 | -0.068 |
| 2005-11-11 | -0.137 | -0.07 |
| 2005-11-14 | -0.137 | -0.069 |
| 2005-11-15 | -0.137 | -0.067 |
| 2005-11-16 | -0.135 | -0.066 |
| 2005-11-17 | -0.135 | -0.068 |
| 2005-11-18 | -0.136 | -0.069 |
| 2005-11-21 | -0.135 | -0.069 |
| 2005-11-22 | -0.134 | -0.068 |
| 2005-11-23 | -0.136 | -0.069 |
| 2005-11-25 | -0.135 | -0.069 |
| 2005-11-28 | -0.136 | -0.07 |
| 2005-11-29 | -0.136 | -0.071 |
| 2005-11-30 | -0.137 | -0.073 |
| 2005-12-01 | -0.134 | -0.073 |
| 2005-12-02 | -0.135 | -0.072 |
| 2005-12-05 | -0.135 | -0.073 |
| 2005-12-06 | -0.134 | -0.072 |
| 2005-12-07 | -0.134 | -0.072 |
| 2005-12-08 | -0.131 | -0.072 |
| 2005-12-09 | -0.133 | -0.073 |
| 2005-12-12 | -0.132 | -0.074 |
| 2005-12-13 | -0.133 | -0.074 |
| 2005-12-14 | -0.133 | -0.073 |
| 2005-12-15 | -0.135 | -0.073 |
| 2005-12-16 | -0.137 | -0.074 |
| 2005-12-19 | -0.138 | -0.072 |
| 2005-12-20 | -0.136 | -0.071 |
| 2005-12-21 | -0.136 | -0.074 |
| 2005-12-22 | -0.137 | -0.076 |
| 2005-12-23 | -0.138 | -0.077 |
| 2005-12-27 | -0.14 | -0.076 |
| 2005-12-28 | -0.139 | -0.076 |
| 2005-12-29 | -0.139 | -0.076 |
| 2005-12-30 | -0.137 | -0.075 |
| 2006-01-03 | -0.133 | -0.074 |
| 2006-01-04 | -0.133 | -0.075 |
| 2006-01-05 | -0.134 | -0.076 |
| 2006-01-06 | -0.133 | -0.076 |
| 2006-01-09 | -0.131 | -0.076 |
| 2006-01-10 | -0.13 | -0.076 |
| 2006-01-11 | -0.13 | -0.075 |
| 2006-01-12 | -0.131 | -0.075 |
| 2006-01-13 | -0.13 | -0.075 |
| 2006-01-17 | -0.128 | -0.073 |
| 2006-01-18 | -0.129 | -0.073 |
| 2006-01-19 | -0.128 | -0.075 |
| 2006-01-20 | -0.126 | -0.074 |
| 2006-01-23 | -0.125 | -0.074 |
| 2006-01-24 | -0.123 | -0.077 |
| 2006-01-25 | -0.125 | -0.077 |
| 2006-01-26 | -0.124 | -0.078 |
| 2006-01-27 | -0.123 | -0.078 |
| 2006-01-30 | -0.121 | -0.078 |
| 2006-01-31 | -0.118 | -0.08 |
| 2006-02-01 | -0.121 | -0.079 |
| 2006-02-02 | -0.12 | -0.078 |
| 2006-02-03 | -0.121 | -0.077 |
| 2006-02-06 | -0.118 | -0.075 |
| 2006-02-07 | -0.123 | -0.074 |
| 2006-02-08 | -0.124 | -0.075 |
| 2006-02-09 | -0.124 | -0.076 |
| 2006-02-10 | -0.126 | -0.075 |
| 2006-02-13 | -0.125 | -0.073 |
| 2006-02-14 | -0.127 | -0.074 |
| 2006-02-15 | -0.13 | -0.076 |
| 2006-02-16 | -0.129 | -0.075 |
| 2006-02-17 | -0.129 | -0.072 |
| 2006-02-21 | -0.124 | -0.068 |
| 2006-02-22 | -0.127 | -0.072 |
| 2006-02-23 | -0.128 | -0.073 |
| 2006-02-24 | -0.128 | -0.073 |
| 2006-02-27 | -0.132 | -0.078 |
| 2006-02-28 | -0.131 | -0.076 |
| 2006-03-01 | -0.131 | -0.074 |
| 2006-03-02 | -0.129 | -0.073 |
| 2006-03-03 | -0.13 | -0.073 |
| 2006-03-06 | -0.131 | -0.075 |
| 2006-03-07 | -0.131 | -0.075 |
| 2006-03-08 | -0.131 | -0.076 |
| 2006-03-09 | -0.131 | -0.075 |
| 2006-03-10 | -0.129 | -0.074 |
| 2006-03-13 | -0.129 | -0.073 |
| 2006-03-14 | -0.128 | -0.072 |
| 2006-03-15 | -0.128 | -0.072 |
| 2006-03-16 | -0.124 | -0.071 |
| 2006-03-17 | -0.125 | -0.072 |
| 2006-03-20 | -0.128 | -0.074 |
| 2006-03-21 | -0.128 | -0.073 |
| 2006-03-22 | -0.126 | -0.072 |
| 2006-03-23 | -0.124 | -0.071 |
| 2006-03-24 | -0.123 | -0.071 |
| 2006-03-27 | -0.123 | -0.072 |
| 2006-03-28 | -0.12 | -0.071 |
| 2006-03-29 | -0.118 | -0.071 |
| 2006-03-30 | -0.119 | -0.071 |
| 2006-03-31 | -0.12 | -0.072 |
| 2006-04-03 | -0.12 | -0.07 |
| 2006-04-04 | -0.119 | -0.07 |
| 2006-04-05 | -0.118 | -0.069 |
| 2006-04-06 | -0.116 | -0.069 |
| 2006-04-07 | -0.117 | -0.069 |
| 2006-04-10 | -0.115 | -0.068 |
| 2006-04-11 | -0.115 | -0.069 |
| 2006-04-12 | -0.115 | -0.069 |
| 2006-04-13 | -0.115 | -0.068 |
| 2006-04-17 | -0.115 | -0.067 |
| 2006-04-18 | -0.114 | -0.068 |
| 2006-04-19 | -0.115 | -0.066 |
| 2006-04-20 | -0.115 | -0.066 |
| 2006-04-21 | -0.114 | -0.065 |
| 2006-04-24 | -0.114 | -0.065 |
| 2006-04-25 | -0.113 | -0.065 |
| 2006-04-26 | -0.112 | -0.066 |
| 2006-04-27 | -0.112 | -0.066 |
| 2006-04-28 | -0.109 | -0.065 |
| 2006-05-01 | -0.107 | -0.063 |
| 2006-05-02 | -0.107 | -0.062 |
| 2006-05-03 | -0.106 | -0.06 |
| 2006-05-04 | -0.107 | -0.061 |
| 2006-05-05 | -0.107 | -0.061 |
| 2006-05-08 | -0.106 | -0.06 |
| 2006-05-09 | -0.106 | -0.059 |
| 2006-05-10 | -0.104 | -0.058 |
| 2006-05-11 | -0.102 | -0.057 |
| 2006-05-12 | -0.1 | -0.058 |
| 2006-05-15 | -0.1 | -0.061 |
| 2006-05-16 | -0.099 | -0.062 |
| 2006-05-17 | -0.099 | -0.063 |
| 2006-05-18 | -0.099 | -0.065 |
| 2006-05-19 | -0.099 | -0.065 |
| 2006-05-22 | -0.1 | -0.065 |
| 2006-05-23 | -0.098 | -0.063 |
| 2006-05-24 | -0.101 | -0.065 |
| 2006-05-25 | -0.102 | -0.065 |
| 2006-05-26 | -0.102 | -0.063 |
| 2006-05-30 | -0.102 | -0.064 |
| 2006-05-31 | -0.101 | -0.064 |
| 2006-06-01 | -0.103 | -0.064 |
| 2006-06-02 | -0.102 | -0.063 |
| 2006-06-05 | -0.101 | -0.062 |
| 2006-06-06 | -0.102 | -0.062 |
| 2006-06-07 | -0.104 | -0.065 |
| 2006-06-08 | -0.103 | -0.065 |
| 2006-06-09 | -0.103 | -0.063 |
| 2006-06-12 | -0.102 | -0.063 |
| 2006-06-13 | -0.102 | -0.065 |
| 2006-06-14 | -0.099 | -0.065 |
| 2006-06-15 | -0.099 | -0.062 |
| 2006-06-16 | -0.097 | -0.061 |
| 2006-06-19 | -0.097 | -0.062 |
| 2006-06-20 | -0.097 | -0.062 |
| 2006-06-21 | -0.097 | -0.059 |
| 2006-06-22 | -0.096 | -0.058 |
| 2006-06-23 | -0.095 | -0.058 |
| 2006-06-26 | -0.097 | -0.058 |
| 2006-06-27 | -0.096 | -0.056 |
| 2006-06-28 | -0.094 | -0.055 |
| 2006-06-29 | -0.096 | -0.053 |
| 2006-06-30 | -0.096 | -0.052 |
| 2006-07-03 | -0.097 | -0.052 |
| 2006-07-05 | -0.096 | -0.05 |
| 2006-07-06 | -0.096 | -0.05 |
| 2006-07-07 | -0.095 | -0.049 |
| 2006-07-10 | -0.093 | -0.046 |
| 2006-07-11 | -0.092 | -0.046 |
| 2006-07-12 | -0.092 | -0.044 |
| 2006-07-13 | -0.091 | -0.047 |
| 2006-07-14 | -0.091 | -0.046 |
| 2006-07-17 | -0.091 | -0.05 |
| 2006-07-18 | -0.091 | -0.049 |
| 2006-07-19 | -0.095 | -0.05 |
| 2006-07-20 | -0.093 | -0.055 |
| 2006-07-21 | -0.09 | -0.058 |
| 2006-07-24 | -0.092 | -0.056 |
| 2006-07-25 | -0.091 | -0.054 |
| 2006-07-26 | -0.089 | -0.053 |
| 2006-07-27 | -0.087 | -0.051 |
| 2006-07-28 | -0.089 | -0.052 |
| 2006-07-31 | -0.09 | -0.051 |
| 2006-08-01 | -0.087 | -0.048 |
| 2006-08-02 | -0.09 | -0.05 |
| 2006-08-03 | -0.093 | -0.052 |
| 2006-08-04 | -0.092 | -0.055 |
| 2006-08-07 | -0.092 | -0.054 |
| 2006-08-08 | -0.091 | -0.053 |
| 2006-08-09 | -0.089 | -0.053 |
| 2006-08-10 | -0.091 | -0.057 |
| 2006-08-11 | -0.09 | -0.058 |
| 2006-08-14 | -0.091 | -0.062 |
| 2006-08-15 | -0.092 | -0.065 |
| 2006-08-16 | -0.095 | -0.065 |
| 2006-08-17 | -0.098 | -0.068 |
| 2006-08-18 | -0.095 | -0.066 |
| 2006-08-21 | -0.093 | -0.064 |
| 2006-08-22 | -0.092 | -0.064 |
| 2006-08-23 | -0.093 | -0.064 |
| 2006-08-24 | -0.093 | -0.064 |
| 2006-08-25 | -0.091 | -0.064 |
| 2006-08-28 | -0.096 | -0.067 |
| 2006-08-29 | -0.098 | -0.068 |
| 2006-08-30 | -0.102 | -0.071 |
| 2006-08-31 | -0.101 | -0.07 |
| 2006-09-01 | -0.101 | -0.07 |
| 2006-09-05 | -0.101 | -0.07 |
| 2006-09-06 | -0.101 | -0.069 |
| 2006-09-07 | -0.101 | -0.069 |
| 2006-09-08 | -0.104 | -0.07 |
| 2006-09-11 | -0.108 | -0.072 |
| 2006-09-12 | -0.111 | -0.076 |
| 2006-09-13 | -0.11 | -0.076 |
| 2006-09-14 | -0.111 | -0.075 |
| 2006-09-15 | -0.111 | -0.076 |
| 2006-09-18 | -0.109 | -0.075 |
| 2006-09-19 | -0.109 | -0.074 |
| 2006-09-20 | -0.112 | -0.075 |
| 2006-09-21 | -0.11 | -0.075 |
| 2006-09-22 | -0.11 | -0.073 |
| 2006-09-25 | -0.111 | -0.073 |
| 2006-09-26 | -0.112 | -0.073 |
| 2006-09-27 | -0.109 | -0.073 |
| 2006-09-28 | -0.11 | -0.073 |
| 2006-09-29 | -0.11 | -0.073 |
| 2006-10-02 | -0.111 | -0.071 |
| 2006-10-03 | -0.112 | -0.07 |
| 2006-10-04 | -0.111 | -0.072 |
| 2006-10-05 | -0.11 | -0.076 |
| 2006-10-06 | -0.11 | -0.076 |
| 2006-10-09 | -0.11 | -0.076 |
| 2006-10-10 | -0.11 | -0.075 |
| 2006-10-11 | -0.11 | -0.074 |
| 2006-10-12 | -0.109 | -0.075 |
| 2006-10-13 | -0.109 | -0.076 |
| 2006-10-16 | -0.109 | -0.079 |
| 2006-10-17 | -0.109 | -0.078 |
| 2006-10-18 | -0.11 | -0.076 |
| 2006-10-19 | -0.11 | -0.078 |
| 2006-10-20 | -0.109 | -0.076 |
| 2006-10-23 | -0.111 | -0.075 |
| 2006-10-24 | -0.111 | -0.076 |
| 2006-10-25 | -0.111 | -0.076 |
| 2006-10-26 | -0.11 | -0.077 |
| 2006-10-27 | -0.111 | -0.077 |
| 2006-10-30 | -0.112 | -0.077 |
| 2006-10-31 | -0.114 | -0.078 |
| 2006-11-01 | -0.112 | -0.076 |
| 2006-11-02 | -0.112 | -0.077 |
| 2006-11-03 | -0.114 | -0.078 |
| 2006-11-06 | -0.114 | -0.079 |
| 2006-11-07 | -0.115 | -0.079 |
| 2006-11-08 | -0.115 | -0.079 |
| 2006-11-09 | -0.116 | -0.08 |
| 2006-11-10 | -0.117 | -0.081 |
| 2006-11-13 | -0.116 | -0.082 |
| 2006-11-14 | -0.117 | -0.084 |
| 2006-11-15 | -0.118 | -0.086 |
| 2006-11-16 | -0.116 | -0.083 |
| 2006-11-17 | -0.115 | -0.083 |
| 2006-11-20 | -0.115 | -0.085 |
| 2006-11-21 | -0.116 | -0.086 |
| 2006-11-22 | -0.117 | -0.086 |
| 2006-11-24 | -0.117 | -0.087 |
| 2006-11-27 | -0.115 | -0.084 |
| 2006-11-28 | -0.115 | -0.086 |
| 2006-11-29 | -0.117 | -0.087 |
| 2006-11-30 | -0.118 | -0.088 |
| 2006-12-01 | -0.117 | -0.087 |
| 2006-12-04 | -0.118 | -0.088 |
| 2006-12-05 | -0.118 | -0.087 |
| 2006-12-06 | -0.118 | -0.086 |
| 2006-12-07 | -0.118 | -0.086 |
| 2006-12-08 | -0.118 | -0.086 |
| 2006-12-11 | -0.117 | -0.084 |
| 2006-12-12 | -0.116 | -0.082 |
| 2006-12-13 | -0.116 | -0.083 |
| 2006-12-14 | -0.117 | -0.082 |
| 2006-12-15 | -0.117 | -0.08 |
| 2006-12-18 | -0.113 | -0.075 |
| 2006-12-19 | -0.111 | -0.076 |
| 2006-12-20 | -0.113 | -0.075 |
| 2006-12-21 | -0.113 | -0.074 |
| 2006-12-22 | -0.114 | -0.074 |
| 2006-12-26 | -0.115 | -0.073 |
| 2006-12-27 | -0.117 | -0.073 |
| 2006-12-28 | -0.117 | -0.074 |
| 2006-12-29 | -0.116 | -0.074 |
| 2007-01-03 | -0.116 | -0.069 |
| 2007-01-04 | -0.117 | -0.069 |
| 2007-01-05 | -0.113 | -0.071 |
| 2007-01-08 | -0.114 | -0.071 |
| 2007-01-09 | -0.113 | -0.07 |
| 2007-01-10 | -0.113 | -0.067 |
| 2007-01-11 | -0.114 | -0.068 |
| 2007-01-12 | -0.115 | -0.072 |
| 2007-01-16 | -0.117 | -0.072 |
| 2007-01-17 | -0.115 | -0.072 |
| 2007-01-18 | -0.115 | -0.07 |
| 2007-01-19 | -0.114 | -0.074 |
| 2007-01-22 | -0.113 | -0.073 |
| 2007-01-23 | -0.113 | -0.076 |
| 2007-01-24 | -0.113 | -0.076 |
| 2007-01-25 | -0.114 | -0.075 |
| 2007-01-26 | -0.114 | -0.077 |
| 2007-01-29 | -0.115 | -0.077 |
| 2007-01-30 | -0.114 | -0.079 |
| 2007-01-31 | -0.114 | -0.079 |
| 2007-02-01 | -0.115 | -0.079 |
| 2007-02-02 | -0.115 | -0.079 |
| 2007-02-05 | -0.113 | -0.079 |
| 2007-02-06 | -0.114 | -0.078 |
| 2007-02-07 | -0.114 | -0.08 |
| 2007-02-08 | -0.113 | -0.08 |
| 2007-02-09 | -0.112 | -0.078 |
| 2007-02-12 | -0.112 | -0.076 |
| 2007-02-13 | -0.113 | -0.077 |
| 2007-02-14 | -0.114 | -0.078 |
| 2007-02-15 | -0.116 | -0.078 |
| 2007-02-16 | -0.116 | -0.079 |
| 2007-02-20 | -0.116 | -0.079 |
| 2007-02-21 | -0.116 | -0.08 |
| 2007-02-22 | -0.116 | -0.08 |
| 2007-02-23 | -0.116 | -0.079 |
| 2007-02-26 | -0.116 | -0.076 |
| 2007-02-27 | -0.114 | -0.073 |
| 2007-02-28 | -0.114 | -0.074 |
| 2007-03-01 | -0.113 | -0.072 |
| 2007-03-02 | -0.113 | -0.071 |
| 2007-03-05 | -0.112 | -0.067 |
| 2007-03-06 | -0.114 | -0.07 |
| 2007-03-07 | -0.112 | -0.07 |
| 2007-03-08 | -0.112 | -0.069 |
| 2007-03-09 | -0.112 | -0.07 |
| 2007-03-12 | -0.111 | -0.069 |
| 2007-03-13 | -0.109 | -0.068 |
| 2007-03-14 | -0.109 | -0.068 |
| 2007-03-15 | -0.111 | -0.069 |
| 2007-03-16 | -0.111 | -0.07 |
| 2007-03-19 | -0.111 | -0.067 |
| 2007-03-20 | -0.111 | -0.066 |
| 2007-03-21 | -0.112 | -0.066 |
| 2007-03-22 | -0.112 | -0.067 |
| 2007-03-23 | -0.112 | -0.067 |
| 2007-03-26 | -0.112 | -0.067 |
| 2007-03-27 | -0.11 | -0.066 |
| 2007-03-28 | -0.11 | -0.066 |
| 2007-03-29 | -0.111 | -0.064 |
| 2007-03-30 | -0.111 | -0.066 |
| 2007-04-02 | -0.111 | -0.066 |
| 2007-04-03 | -0.111 | -0.066 |
| 2007-04-04 | -0.111 | -0.066 |
| 2007-04-05 | -0.111 | -0.066 |
| 2007-04-09 | -0.111 | -0.065 |
| 2007-04-10 | -0.112 | -0.065 |
| 2007-04-11 | -0.111 | -0.065 |
| 2007-04-12 | -0.112 | -0.065 |
| 2007-04-13 | -0.114 | -0.066 |
| 2007-04-16 | -0.117 | -0.068 |
| 2007-04-17 | -0.115 | -0.068 |
| 2007-04-18 | -0.115 | -0.067 |
| 2007-04-19 | -0.113 | -0.068 |
| 2007-04-20 | -0.113 | -0.068 |
| 2007-04-23 | -0.111 | -0.066 |
| 2007-04-24 | -0.111 | -0.068 |
| 2007-04-25 | -0.111 | -0.068 |
| 2007-04-26 | -0.113 | -0.069 |
| 2007-04-27 | -0.112 | -0.068 |
| 2007-04-30 | -0.111 | -0.068 |
| 2007-05-01 | -0.112 | -0.069 |
| 2007-05-02 | -0.113 | -0.07 |
| 2007-05-03 | -0.114 | -0.07 |
| 2007-05-04 | -0.114 | -0.071 |
| 2007-05-07 | -0.115 | -0.071 |
| 2007-05-08 | -0.115 | -0.071 |
| 2007-05-09 | -0.114 | -0.07 |
| 2007-05-10 | -0.114 | -0.068 |
| 2007-05-11 | -0.114 | -0.069 |
| 2007-05-14 | -0.114 | -0.069 |
| 2007-05-15 | -0.114 | -0.069 |
| 2007-05-16 | -0.115 | -0.069 |
| 2007-05-17 | -0.115 | -0.07 |
| 2007-05-18 | -0.117 | -0.072 |
| 2007-05-21 | -0.118 | -0.074 |
| 2007-05-22 | -0.117 | -0.074 |
| 2007-05-23 | -0.118 | -0.076 |
| 2007-05-24 | -0.118 | -0.075 |
| 2007-05-25 | -0.118 | -0.075 |
| 2007-05-29 | -0.117 | -0.073 |
| 2007-05-30 | -0.116 | -0.071 |
| 2007-05-31 | -0.116 | -0.073 |
| 2007-06-01 | -0.116 | -0.074 |
| 2007-06-04 | -0.115 | -0.074 |
| 2007-06-05 | -0.115 | -0.074 |
| 2007-06-06 | -0.115 | -0.072 |
| 2007-06-07 | -0.114 | -0.072 |
| 2007-06-08 | -0.114 | -0.073 |
| 2007-06-11 | -0.114 | -0.073 |
| 2007-06-12 | -0.113 | -0.072 |
| 2007-06-13 | -0.112 | -0.072 |
| 2007-06-14 | -0.112 | -0.073 |
| 2007-06-15 | -0.112 | -0.074 |
| 2007-06-18 | -0.112 | -0.075 |
| 2007-06-19 | -0.112 | -0.074 |
| 2007-06-20 | -0.113 | -0.075 |
| 2007-06-21 | -0.114 | -0.077 |
| 2007-06-22 | -0.115 | -0.077 |
| 2007-06-25 | -0.113 | -0.076 |
| 2007-06-26 | -0.112 | -0.075 |
| 2007-06-27 | -0.113 | -0.075 |
| 2007-06-28 | -0.114 | -0.075 |
| 2007-06-29 | -0.114 | -0.075 |
| 2007-07-02 | -0.115 | -0.074 |
| 2007-07-03 | -0.115 | -0.074 |
| 2007-07-05 | -0.116 | -0.075 |
| 2007-07-06 | -0.117 | -0.078 |
| 2007-07-09 | -0.117 | -0.078 |
| 2007-07-10 | -0.117 | -0.077 |
| 2007-07-11 | -0.117 | -0.078 |
| 2007-07-12 | -0.119 | -0.08 |
| 2007-07-13 | -0.119 | -0.079 |
| 2007-07-16 | -0.12 | -0.078 |
| 2007-07-17 | -0.122 | -0.078 |
| 2007-07-18 | -0.121 | -0.078 |
| 2007-07-19 | -0.121 | -0.076 |
| 2007-07-20 | -0.12 | -0.076 |
| 2007-07-23 | -0.12 | -0.074 |
| 2007-07-24 | -0.118 | -0.074 |
| 2007-07-25 | -0.115 | -0.074 |
| 2007-07-26 | -0.115 | -0.073 |
| 2007-07-27 | -0.115 | -0.075 |
| 2007-07-30 | -0.115 | -0.076 |
| 2007-07-31 | -0.115 | -0.076 |
| 2007-08-01 | -0.113 | -0.072 |
| 2007-08-02 | -0.113 | -0.073 |
| 2007-08-03 | -0.111 | -0.073 |
| 2007-08-06 | -0.114 | -0.071 |
| 2007-08-07 | -0.114 | -0.071 |
| 2007-08-08 | -0.113 | -0.077 |
| 2007-08-09 | -0.111 | -0.079 |
| 2007-08-10 | -0.114 | -0.074 |
| 2007-08-13 | -0.114 | -0.072 |
| 2007-08-14 | -0.113 | -0.071 |
| 2007-08-15 | -0.113 | -0.071 |
| 2007-08-16 | -0.11 | -0.077 |
| 2007-08-17 | -0.113 | -0.076 |
| 2007-08-20 | -0.112 | -0.074 |
| 2007-08-21 | -0.113 | -0.075 |
| 2007-08-22 | -0.113 | -0.072 |
| 2007-08-23 | -0.113 | -0.072 |
| 2007-08-24 | -0.112 | -0.07 |
| 2007-08-27 | -0.113 | -0.071 |
| 2007-08-28 | -0.111 | -0.071 |
| 2007-08-29 | -0.111 | -0.069 |
| 2007-08-30 | -0.11 | -0.068 |
| 2007-08-31 | -0.11 | -0.068 |
| 2007-09-04 | -0.112 | -0.067 |
| 2007-09-05 | -0.111 | -0.065 |
| 2007-09-06 | -0.112 | -0.066 |
| 2007-09-07 | -0.111 | -0.067 |
| 2007-09-10 | -0.113 | -0.067 |
| 2007-09-11 | -0.113 | -0.068 |
| 2007-09-12 | -0.113 | -0.067 |
| 2007-09-13 | -0.113 | -0.066 |
| 2007-09-14 | -0.113 | -0.065 |
| 2007-09-17 | -0.113 | -0.066 |
| 2007-09-18 | -0.114 | -0.065 |
| 2007-09-19 | -0.112 | -0.065 |
| 2007-09-20 | -0.113 | -0.064 |
| 2007-09-21 | -0.114 | -0.064 |
| 2007-09-24 | -0.115 | -0.066 |
| 2007-09-25 | -0.116 | -0.067 |
| 2007-09-26 | -0.116 | -0.065 |
| 2007-09-27 | -0.115 | -0.065 |
| 2007-09-28 | -0.116 | -0.066 |
| 2007-10-01 | -0.116 | -0.067 |
| 2007-10-02 | -0.114 | -0.069 |
| 2007-10-03 | -0.114 | -0.07 |
| 2007-10-04 | -0.114 | -0.07 |
| 2007-10-05 | -0.112 | -0.072 |
| 2007-10-08 | -0.111 | -0.074 |
| 2007-10-09 | -0.112 | -0.073 |
| 2007-10-10 | -0.111 | -0.072 |
| 2007-10-11 | -0.113 | -0.069 |
| 2007-10-12 | -0.113 | -0.069 |
| 2007-10-15 | -0.113 | -0.067 |
| 2007-10-16 | -0.114 | -0.067 |
| 2007-10-17 | -0.114 | -0.069 |
| 2007-10-18 | -0.113 | -0.07 |
| 2007-10-19 | -0.113 | -0.07 |
| 2007-10-22 | -0.112 | -0.073 |
| 2007-10-23 | -0.11 | -0.073 |
| 2007-10-24 | -0.108 | -0.069 |
| 2007-10-25 | -0.106 | -0.066 |
| 2007-10-26 | -0.105 | -0.065 |
| 2007-10-29 | -0.104 | -0.066 |
| 2007-10-30 | -0.104 | -0.067 |
| 2007-10-31 | -0.104 | -0.067 |
| 2007-11-01 | -0.104 | -0.068 |
| 2007-11-02 | -0.103 | -0.069 |
| 2007-11-05 | -0.103 | -0.07 |
| 2007-11-06 | -0.101 | -0.071 |
| 2007-11-07 | -0.101 | -0.074 |
| 2007-11-08 | -0.098 | -0.067 |
| 2007-11-09 | -0.098 | -0.068 |
| 2007-11-12 | -0.1 | -0.066 |
| 2007-11-13 | -0.102 | -0.07 |
| 2007-11-14 | -0.102 | -0.069 |
| 2007-11-15 | -0.103 | -0.067 |
| 2007-11-16 | -0.105 | -0.069 |
| 2007-11-19 | -0.105 | -0.071 |
| 2007-11-20 | -0.107 | -0.072 |
| 2007-11-21 | -0.104 | -0.07 |
| 2007-11-23 | -0.105 | -0.069 |
| 2007-11-26 | -0.105 | -0.072 |
| 2007-11-27 | -0.106 | -0.07 |
| 2007-11-28 | -0.107 | -0.07 |
| 2007-11-29 | -0.107 | -0.07 |
| 2007-11-30 | -0.106 | -0.068 |
| 2007-12-03 | -0.105 | -0.068 |
| 2007-12-04 | -0.104 | -0.068 |
| 2007-12-05 | -0.103 | -0.068 |
| 2007-12-06 | -0.104 | -0.067 |
| 2007-12-07 | -0.104 | -0.065 |
| 2007-12-10 | -0.105 | -0.065 |
| 2007-12-11 | -0.104 | -0.067 |
| 2007-12-12 | -0.105 | -0.069 |
| 2007-12-13 | -0.101 | -0.067 |
| 2007-12-14 | -0.102 | -0.068 |
| 2007-12-17 | -0.1 | -0.064 |
| 2007-12-18 | -0.1 | -0.066 |
| 2007-12-19 | -0.104 | -0.07 |
| 2007-12-20 | -0.106 | -0.074 |
| 2007-12-21 | -0.106 | -0.076 |
| 2007-12-24 | -0.105 | -0.075 |
| 2007-12-26 | -0.107 | -0.077 |
| 2007-12-27 | -0.107 | -0.077 |
| 2007-12-28 | -0.109 | -0.079 |
| 2007-12-31 | -0.109 | -0.078 |
| 2008-01-02 | -0.112 | -0.079 |
| 2008-01-03 | -0.113 | -0.076 |
| 2008-01-04 | -0.112 | -0.073 |
| 2008-01-07 | -0.109 | -0.072 |
| 2008-01-08 | -0.111 | -0.071 |
| 2008-01-09 | -0.112 | -0.07 |
| 2008-01-10 | -0.113 | -0.071 |
| 2008-01-11 | -0.115 | -0.07 |
| 2008-01-14 | -0.116 | -0.07 |
| 2008-01-15 | -0.115 | -0.069 |
| 2008-01-16 | -0.119 | -0.063 |
| 2008-01-17 | -0.118 | -0.06 |
| 2008-01-18 | -0.117 | -0.058 |
| 2008-01-22 | -0.121 | -0.052 |
| 2008-01-23 | -0.123 | -0.048 |
| 2008-01-24 | -0.123 | -0.05 |
| 2008-01-25 | -0.124 | -0.053 |
| 2008-01-28 | -0.128 | -0.053 |
| 2008-01-29 | -0.129 | -0.053 |
| 2008-01-30 | -0.128 | -0.052 |
| 2008-01-31 | -0.129 | -0.05 |
| 2008-02-01 | -0.129 | -0.054 |
| 2008-02-04 | -0.131 | -0.052 |
| 2008-02-05 | -0.128 | -0.048 |
| 2008-02-06 | -0.127 | -0.047 |
| 2008-02-07 | -0.124 | -0.046 |
| 2008-02-08 | -0.125 | -0.045 |
| 2008-02-11 | -0.124 | -0.042 |
| 2008-02-12 | -0.124 | -0.042 |
| 2008-02-13 | -0.125 | -0.042 |
| 2008-02-14 | -0.126 | -0.041 |
| 2008-02-15 | -0.126 | -0.039 |
| 2008-02-19 | -0.128 | -0.039 |
| 2008-02-20 | -0.127 | -0.041 |
| 2008-02-21 | -0.126 | -0.04 |
| 2008-02-22 | -0.123 | -0.039 |
| 2008-02-25 | -0.127 | -0.039 |
| 2008-02-26 | -0.128 | -0.039 |
| 2008-02-27 | -0.128 | -0.039 |
| 2008-02-28 | -0.13 | -0.04 |
| 2008-02-29 | -0.131 | -0.038 |
| 2008-03-03 | -0.129 | -0.034 |
| 2008-03-04 | -0.128 | -0.032 |
| 2008-03-05 | -0.127 | -0.033 |
| 2008-03-06 | -0.125 | -0.03 |
| 2008-03-07 | -0.126 | -0.027 |
| 2008-03-10 | -0.125 | -0.022 |
| 2008-03-11 | -0.127 | -0.027 |
| 2008-03-12 | -0.129 | -0.026 |
| 2008-03-13 | -0.131 | -0.028 |
| 2008-03-14 | -0.128 | -0.025 |
| 2008-03-17 | -0.126 | -0.023 |
| 2008-03-18 | -0.127 | -0.035 |
| 2008-03-19 | -0.128 | -0.035 |
| 2008-03-20 | -0.13 | -0.042 |
| 2008-03-24 | -0.13 | -0.04 |
| 2008-03-25 | -0.129 | -0.039 |
| 2008-03-26 | -0.13 | -0.036 |
| 2008-03-27 | -0.129 | -0.034 |
| 2008-03-28 | -0.128 | -0.03 |
| 2008-03-31 | -0.127 | -0.029 |
| 2008-04-01 | -0.131 | -0.036 |
| 2008-04-02 | -0.13 | -0.035 |
| 2008-04-03 | -0.126 | -0.034 |
| 2008-04-04 | -0.122 | -0.034 |
| 2008-04-07 | -0.122 | -0.035 |
| 2008-04-08 | -0.121 | -0.033 |
| 2008-04-09 | -0.117 | -0.033 |
| 2008-04-10 | -0.117 | -0.033 |
| 2008-04-11 | -0.114 | -0.03 |
| 2008-04-14 | -0.109 | -0.028 |
| 2008-04-15 | -0.109 | -0.028 |
| 2008-04-16 | -0.109 | -0.031 |
| 2008-04-17 | -0.109 | -0.032 |
| 2008-04-18 | -0.11 | -0.037 |
| 2008-04-21 | -0.108 | -0.038 |
| 2008-04-22 | -0.109 | -0.037 |
| 2008-04-23 | -0.111 | -0.038 |
| 2008-04-24 | -0.111 | -0.04 |
| 2008-04-25 | -0.111 | -0.042 |
| 2008-04-28 | -0.112 | -0.041 |
| 2008-04-29 | -0.111 | -0.04 |
| 2008-04-30 | -0.111 | -0.04 |
| 2008-05-01 | -0.11 | -0.039 |
| 2008-05-02 | -0.109 | -0.042 |
| 2008-05-05 | -0.109 | -0.043 |
| 2008-05-06 | -0.11 | -0.045 |
| 2008-05-07 | -0.111 | -0.043 |
| 2008-05-08 | -0.111 | -0.045 |
| 2008-05-09 | -0.112 | -0.044 |
| 2008-05-12 | -0.113 | -0.042 |
| 2008-05-13 | -0.114 | -0.041 |
| 2008-05-14 | -0.114 | -0.039 |
| 2008-05-15 | -0.113 | -0.042 |
| 2008-05-16 | -0.112 | -0.044 |
| 2008-05-19 | -0.112 | -0.044 |
| 2008-05-20 | -0.112 | -0.046 |
| 2008-05-21 | -0.113 | -0.046 |
| 2008-05-22 | -0.114 | -0.046 |
| 2008-05-23 | -0.113 | -0.048 |
| 2008-05-27 | -0.114 | -0.048 |
| 2008-05-28 | -0.112 | -0.048 |
| 2008-05-29 | -0.114 | -0.044 |
| 2008-05-30 | -0.113 | -0.048 |
| 2008-06-02 | -0.112 | -0.05 |
| 2008-06-03 | -0.111 | -0.049 |
| 2008-06-04 | -0.112 | -0.049 |
| 2008-06-05 | -0.111 | -0.053 |
| 2008-06-06 | -0.11 | -0.055 |
| 2008-06-09 | -0.108 | -0.056 |
| 2008-06-10 | -0.109 | -0.052 |
| 2008-06-11 | -0.107 | -0.055 |
| 2008-06-12 | -0.109 | -0.054 |
| 2008-06-13 | -0.107 | -0.054 |
| 2008-06-16 | -0.108 | -0.055 |
| 2008-06-17 | -0.106 | -0.059 |
| 2008-06-18 | -0.104 | -0.058 |
| 2008-06-19 | -0.106 | -0.055 |
| 2008-06-20 | -0.104 | -0.054 |
| 2008-06-23 | -0.101 | -0.057 |
| 2008-06-24 | -0.103 | -0.055 |
| 2008-06-25 | -0.104 | -0.057 |
| 2008-06-26 | -0.103 | -0.058 |
| 2008-06-27 | -0.101 | -0.062 |
| 2008-06-30 | -0.098 | -0.061 |
| 2008-07-01 | -0.1 | -0.059 |
| 2008-07-02 | -0.103 | -0.055 |
| 2008-07-03 | -0.106 | -0.055 |
| 2008-07-07 | -0.104 | -0.059 |
| 2008-07-08 | -0.104 | -0.055 |
| 2008-07-09 | -0.102 | -0.059 |
| 2008-07-10 | -0.102 | -0.064 |
| 2008-07-11 | -0.1 | -0.068 |
| 2008-07-14 | -0.098 | -0.074 |
| 2008-07-15 | -0.096 | -0.079 |
| 2008-07-16 | -0.086 | -0.077 |
| 2008-07-17 | -0.076 | -0.075 |
| 2008-07-18 | -0.078 | -0.075 |
| 2008-07-21 | -0.081 | -0.074 |
| 2008-07-22 | -0.072 | -0.075 |
| 2008-07-23 | -0.066 | -0.077 |
| 2008-07-24 | -0.068 | -0.075 |
| 2008-07-25 | -0.07 | -0.078 |
| 2008-07-28 | -0.073 | -0.08 |
| 2008-07-29 | -0.066 | -0.077 |
| 2008-07-30 | -0.069 | -0.072 |
| 2008-07-31 | -0.068 | -0.074 |
| 2008-08-01 | -0.066 | -0.071 |
| 2008-08-04 | -0.064 | -0.065 |
| 2008-08-05 | -0.065 | -0.062 |
| 2008-08-06 | -0.063 | -0.064 |
| 2008-08-07 | -0.062 | -0.064 |
| 2008-08-08 | -0.059 | -0.057 |
| 2008-08-11 | -0.059 | -0.054 |
| 2008-08-12 | -0.058 | -0.054 |
| 2008-08-13 | -0.059 | -0.059 |
| 2008-08-14 | -0.057 | -0.058 |
| 2008-08-15 | -0.057 | -0.056 |
| 2008-08-18 | -0.057 | -0.056 |
| 2008-08-19 | -0.058 | -0.065 |
| 2008-08-20 | -0.057 | -0.073 |
| 2008-08-21 | -0.059 | -0.079 |
| 2008-08-22 | -0.059 | -0.07 |
| 2008-08-25 | -0.058 | -0.071 |
| 2008-08-26 | -0.057 | -0.073 |
| 2008-08-27 | -0.057 | -0.077 |
| 2008-08-28 | -0.056 | -0.072 |
| 2008-08-29 | -0.055 | -0.071 |
| 2008-09-02 | -0.053 | -0.054 |
| 2008-09-03 | -0.052 | -0.046 |
| 2008-09-04 | -0.055 | -0.045 |
| 2008-09-05 | -0.056 | -0.046 |
| 2008-09-08 | -0.056 | -0.034 |
| 2008-09-09 | -0.056 | -0.017 |
| 2008-09-10 | -0.054 | -0.022 |
| 2008-09-11 | -0.055 | -0.021 |
| 2008-09-12 | -0.058 | -0.032 |
| 2008-09-15 | -0.054 | -0.015 |
| 2008-09-16 | -0.052 | -0.02 |
| 2008-09-17 | -0.053 | -0.022 |
| 2008-09-18 | -0.049 | -0.029 |
| 2008-09-19 | -0.05 | -0.046 |
| 2008-09-22 | -0.051 | -0.049 |
| 2008-09-23 | -0.049 | -0.043 |
| 2008-09-24 | -0.053 | -0.042 |
| 2008-09-25 | -0.054 | -0.04 |
| 2008-09-26 | -0.053 | -0.032 |
| 2008-09-29 | -0.047 | -0.021 |
| 2008-09-30 | -0.048 | -0.028 |
| 2008-10-01 | -0.046 | -0.029 |
| 2008-10-02 | -0.044 | -0.028 |
| 2008-10-03 | -0.048 | -0.028 |
| 2008-10-06 | -0.046 | -0.023 |
| 2008-10-07 | -0.049 | -0.018 |
| 2008-10-08 | -0.055 | -0.019 |
| 2008-10-09 | -0.058 | -0.015 |
| 2008-10-10 | -0.046 | -0.011 |
| 2008-10-13 | -0.055 | -0.016 |
| 2008-10-14 | -0.051 | -0.02 |
| 2008-10-15 | -0.045 | -0.011 |
| 2008-10-16 | -0.044 | -0.01 |
| 2008-10-17 | -0.045 | -0.007 |
| 2008-10-20 | -0.048 | -0.012 |
| 2008-10-21 | -0.044 | -0.01 |
| 2008-10-22 | -0.039 | -0.006 |
| 2008-10-23 | -0.039 | -0.015 |
| 2008-10-24 | -0.038 | -0.011 |
| 2008-10-27 | -0.037 | -0.012 |
| 2008-10-28 | -0.044 | -0.015 |
| 2008-10-29 | -0.044 | -0.015 |
| 2008-10-30 | -0.041 | -0.01 |
| 2008-10-31 | -0.037 | -0.005 |
| 2008-11-03 | -0.039 | -0.004 |
| 2008-11-04 | -0.046 | -0.014 |
| 2008-11-05 | -0.044 | -0.008 |
| 2008-11-06 | -0.041 | -0.004 |
| 2008-11-07 | -0.045 | -0.007 |
| 2008-11-10 | -0.047 | -0.008 |
| 2008-11-11 | -0.046 | -0.007 |
| 2008-11-12 | -0.044 | -0.004 |
| 2008-11-13 | -0.044 | -0.004 |
| 2008-11-14 | -0.044 | -0.004 |
| 2008-11-17 | -0.042 | -0.004 |
| 2008-11-18 | -0.043 | -0.008 |
| 2008-11-19 | -0.042 | -0.012 |
| 2008-11-20 | -0.043 | -0.014 |
| 2008-11-21 | -0.048 | -0.013 |
| 2008-11-24 | -0.049 | -0.006 |
| 2008-11-25 | -0.048 | -0.004 |
| 2008-11-26 | -0.046 | -0.001 |
| 2008-11-28 | -0.046 | 0 |
| 2008-12-01 | -0.043 | 0.003 |
| 2008-12-02 | -0.044 | 0.002 |
| 2008-12-03 | -0.046 | 0.005 |
| 2008-12-04 | -0.042 | 0.009 |
| 2008-12-05 | -0.043 | 0.007 |
| 2008-12-08 | -0.047 | 0.003 |
| 2008-12-09 | -0.045 | 0.006 |
| 2008-12-10 | -0.047 | 0.008 |
| 2008-12-11 | -0.043 | 0.008 |
| 2008-12-12 | -0.044 | 0.012 |
| 2008-12-15 | -0.044 | 0.014 |
| 2008-12-16 | -0.042 | 0.018 |
| 2008-12-17 | -0.043 | 0.018 |
| 2008-12-18 | -0.04 | 0.018 |
| 2008-12-19 | -0.041 | 0.019 |
| 2008-12-22 | -0.044 | 0.018 |
| 2008-12-23 | -0.044 | 0.019 |
| 2008-12-24 | -0.044 | 0.018 |
| 2008-12-26 | -0.042 | 0.017 |
| 2008-12-29 | -0.043 | 0.016 |
| 2008-12-30 | -0.044 | 0.016 |
| 2008-12-31 | -0.043 | 0.016 |
| 2009-01-02 | -0.042 | 0.017 |
| 2009-01-05 | -0.042 | 0.018 |
| 2009-01-06 | -0.045 | 0.018 |
| 2009-01-07 | -0.046 | 0.02 |
| 2009-01-08 | -0.044 | 0.021 |
| 2009-01-09 | -0.044 | 0.023 |
| 2009-01-12 | -0.047 | 0.021 |
| 2009-01-13 | -0.048 | 0.019 |
| 2009-01-14 | -0.047 | 0.021 |
| 2009-01-15 | -0.048 | 0.025 |
| 2009-01-16 | -0.047 | 0.027 |
| 2009-01-20 | -0.037 | 0.026 |
| 2009-01-21 | -0.041 | 0.024 |
| 2009-01-22 | -0.036 | 0.025 |
| 2009-01-23 | -0.037 | 0.027 |
| 2009-01-26 | -0.037 | 0.026 |
| 2009-01-27 | -0.04 | 0.026 |
| 2009-01-28 | -0.045 | 0.027 |
| 2009-01-29 | -0.038 | 0.024 |
| 2009-01-30 | -0.038 | 0.021 |
| 2009-02-02 | -0.037 | 0.021 |
| 2009-02-03 | -0.039 | 0.018 |
| 2009-02-04 | -0.041 | 0.018 |
| 2009-02-05 | -0.04 | 0.017 |
| 2009-02-06 | -0.041 | 0.017 |
| 2009-02-09 | -0.041 | 0.016 |
| 2009-02-10 | -0.041 | 0.015 |
| 2009-02-11 | -0.043 | 0.016 |
| 2009-02-12 | -0.042 | 0.014 |
| 2009-02-13 | -0.042 | 0.011 |
| 2009-02-17 | -0.04 | 0.014 |
| 2009-02-18 | -0.038 | 0.014 |
| 2009-02-19 | -0.042 | 0.012 |
| 2009-02-20 | -0.04 | 0.014 |
| 2009-02-23 | -0.035 | 0.019 |
| 2009-02-24 | -0.036 | 0.02 |
| 2009-02-25 | -0.03 | 0.022 |
| 2009-02-26 | -0.029 | 0.021 |
| 2009-02-27 | -0.031 | 0.019 |
| 2009-03-02 | -0.029 | 0.027 |
| 2009-03-03 | -0.026 | 0.021 |
| 2009-03-04 | -0.027 | 0.016 |
| 2009-03-05 | -0.024 | 0.019 |
| 2009-03-06 | -0.024 | 0.016 |
| 2009-03-09 | -0.021 | 0.017 |
| 2009-03-10 | -0.023 | 0.01 |
| 2009-03-11 | -0.025 | 0.01 |
| 2009-03-12 | -0.025 | 0.005 |
| 2009-03-13 | -0.026 | 0.002 |
| 2009-03-16 | -0.029 | 0.001 |
| 2009-03-17 | -0.024 | 0.003 |
| 2009-03-18 | -0.021 | 0.008 |
| 2009-03-19 | -0.022 | 0.004 |
| 2009-03-20 | -0.026 | 0.005 |
| 2009-03-23 | -0.017 | 0.005 |
| 2009-03-24 | -0.018 | 0.002 |
| 2009-03-25 | -0.02 | 0.006 |
| 2009-03-26 | -0.017 | 0.002 |
| 2009-03-27 | -0.019 | 0.004 |
| 2009-03-30 | -0.026 | 0.002 |
| 2009-03-31 | -0.025 | 0.004 |
| 2009-04-01 | -0.027 | 0.004 |
| 2009-04-02 | -0.027 | 0.004 |
| 2009-04-03 | -0.023 | 0.007 |
| 2009-04-06 | -0.024 | 0.006 |
| 2009-04-07 | -0.024 | 0.004 |
| 2009-04-08 | -0.022 | 0.003 |
| 2009-04-09 | -0.015 | 0.01 |
| 2009-04-13 | -0.01 | 0.014 |
| 2009-04-14 | -0.015 | 0.008 |
| 2009-04-15 | -0.015 | 0.012 |
| 2009-04-16 | -0.012 | 0.012 |
| 2009-04-17 | -0.01 | 0.011 |
| 2009-04-20 | -0.014 | 0.006 |
| 2009-04-21 | -0.01 | 0.009 |
| 2009-04-22 | -0.006 | 0.01 |
| 2009-04-23 | -0.006 | 0.012 |
| 2009-04-24 | -0.004 | 0.013 |
| 2009-04-27 | -0.007 | 0.01 |
| 2009-04-28 | -0.007 | 0.008 |
| 2009-04-29 | -0.006 | 0.004 |
| 2009-04-30 | -0.007 | 0.002 |
| 2009-05-01 | -0.004 | 0 |
| 2009-05-04 | -0.003 | 0.005 |
| 2009-05-05 | -0.001 | 0.004 |
| 2009-05-06 | 0 | 0.006 |
| 2009-05-07 | -0.004 | 0 |
| 2009-05-08 | -0.006 | -0.001 |
| 2009-05-11 | -0.005 | -0.004 |
| 2009-05-12 | -0.007 | -0.009 |
| 2009-05-13 | -0.011 | -0.013 |
| 2009-05-14 | -0.01 | -0.011 |
| 2009-05-15 | -0.01 | -0.012 |
| 2009-05-18 | -0.009 | -0.004 |
| 2009-05-19 | -0.007 | -0.006 |
| 2009-05-20 | -0.011 | -0.011 |
| 2009-05-21 | -0.011 | -0.011 |
| 2009-05-22 | -0.012 | -0.013 |
| 2009-05-26 | -0.008 | -0.01 |
| 2009-05-27 | -0.007 | -0.014 |
| 2009-05-28 | -0.007 | -0.013 |
| 2009-05-29 | -0.007 | -0.011 |
| 2009-06-01 | -0.007 | -0.009 |
| 2009-06-02 | -0.008 | -0.009 |
| 2009-06-03 | -0.007 | -0.012 |
| 2009-06-04 | -0.003 | -0.008 |
| 2009-06-05 | -0.001 | -0.008 |
| 2009-06-08 | -0.004 | -0.009 |
| 2009-06-09 | -0.004 | -0.008 |
| 2009-06-10 | -0.004 | -0.01 |
| 2009-06-11 | -0.003 | -0.013 |
| 2009-06-12 | -0.004 | -0.013 |
| 2009-06-15 | -0.004 | -0.015 |
| 2009-06-16 | -0.004 | -0.014 |
| 2009-06-17 | -0.006 | -0.013 |
| 2009-06-18 | -0.007 | -0.012 |
| 2009-06-19 | -0.005 | -0.012 |
| 2009-06-22 | -0.007 | -0.008 |
| 2009-06-23 | -0.006 | -0.008 |
| 2009-06-24 | -0.005 | -0.008 |
| 2009-06-25 | -0.007 | -0.01 |
| 2009-06-26 | -0.005 | -0.011 |
| 2009-06-29 | -0.005 | -0.01 |
| 2009-06-30 | -0.005 | -0.011 |
| 2009-07-01 | -0.005 | -0.012 |
| 2009-07-02 | -0.003 | -0.013 |
| 2009-07-06 | -0.005 | -0.016 |
| 2009-07-07 | -0.004 | -0.017 |
| 2009-07-08 | -0.006 | -0.018 |
| 2009-07-09 | -0.004 | -0.014 |
| 2009-07-10 | -0.003 | -0.013 |
| 2009-07-13 | -0.006 | -0.012 |
| 2009-07-14 | -0.005 | -0.01 |
| 2009-07-15 | -0.007 | -0.01 |
| 2009-07-16 | -0.005 | -0.01 |
| 2009-07-17 | -0.003 | -0.009 |
| 2009-07-20 | 0.001 | -0.007 |
| 2009-07-21 | 0 | -0.007 |
| 2009-07-22 | 0 | -0.01 |
| 2009-07-23 | 0.002 | -0.007 |
| 2009-07-24 | 0.006 | -0.005 |
| 2009-07-27 | 0.007 | -0.005 |
| 2009-07-28 | 0.005 | -0.008 |
| 2009-07-29 | 0.001 | -0.01 |
| 2009-07-30 | 0.006 | -0.009 |
| 2009-07-31 | 0.011 | -0.006 |
| 2009-08-03 | 0.013 | -0.004 |
| 2009-08-04 | 0.014 | -0.002 |
| 2009-08-05 | 0.015 | 0.002 |
| 2009-08-06 | 0.014 | 0.002 |
| 2009-08-07 | 0.017 | 0.005 |
| 2009-08-10 | 0.018 | 0.004 |
| 2009-08-11 | 0.016 | 0.001 |
| 2009-08-12 | 0.018 | 0.001 |
| 2009-08-13 | 0.018 | 0.001 |
| 2009-08-14 | 0.016 | 0.001 |
| 2009-08-17 | 0.011 | -0.001 |
| 2009-08-18 | 0.014 | 0 |
| 2009-08-19 | 0.013 | -0.001 |
| 2009-08-20 | 0.016 | -0.001 |
| 2009-08-21 | 0.015 | -0.002 |
| 2009-08-24 | 0.014 | -0.004 |
| 2009-08-25 | 0.014 | -0.004 |
| 2009-08-26 | 0.014 | -0.004 |
| 2009-08-27 | 0.015 | -0.004 |
| 2009-08-28 | 0.015 | -0.002 |
| 2009-08-31 | 0.013 | -0.004 |
| 2009-09-01 | 0.008 | -0.006 |
| 2009-09-02 | 0.006 | -0.007 |
| 2009-09-03 | 0.01 | -0.005 |
| 2009-09-04 | 0.013 | -0.005 |
| 2009-09-08 | 0.014 | -0.005 |
| 2009-09-09 | 0.018 | -0.003 |
| 2009-09-10 | 0.021 | -0.002 |
| 2009-09-11 | 0.021 | -0.003 |
| 2009-09-14 | 0.022 | -0.002 |
| 2009-09-15 | 0.024 | 0 |
| 2009-09-16 | 0.026 | -0.001 |
| 2009-09-17 | 0.026 | -0.002 |
| 2009-09-18 | 0.026 | -0.002 |
| 2009-09-21 | 0.027 | -0.002 |
| 2009-09-22 | 0.027 | -0.002 |
| 2009-09-23 | 0.027 | -0.002 |
| 2009-09-24 | 0.023 | -0.002 |
| 2009-09-25 | 0.022 | -0.004 |
| 2009-09-28 | 0.025 | -0.003 |
| 2009-09-29 | 0.024 | -0.002 |
| 2009-09-30 | 0.023 | -0.003 |
| 2009-10-01 | 0.02 | -0.006 |
| 2009-10-02 | 0.02 | -0.004 |
| 2009-10-05 | 0.021 | -0.001 |
| 2009-10-06 | 0.023 | 0 |
| 2009-10-07 | 0.024 | 0.002 |
| 2009-10-08 | 0.025 | 0.002 |
| 2009-10-09 | 0.025 | 0.002 |
| 2009-10-12 | 0.025 | 0.002 |
| 2009-10-13 | 0.026 | 0.002 |
| 2009-10-14 | 0.026 | 0.004 |
| 2009-10-15 | 0.025 | 0.003 |
| 2009-10-16 | 0.025 | 0.002 |
| 2009-10-19 | 0.026 | 0.002 |
| 2009-10-20 | 0.026 | 0.002 |
| 2009-10-21 | 0.026 | 0.002 |
| 2009-10-22 | 0.024 | 0.002 |
| 2009-10-23 | 0.022 | 0.001 |
| 2009-10-26 | 0.023 | 0 |
| 2009-10-27 | 0.02 | -0.003 |
| 2009-10-28 | 0.017 | -0.006 |
| 2009-10-29 | 0.017 | -0.005 |
| 2009-10-30 | 0.016 | -0.006 |
| 2009-11-02 | 0.015 | -0.006 |
| 2009-11-03 | 0.021 | -0.004 |
| 2009-11-04 | 0.02 | -0.004 |
| 2009-11-05 | 0.021 | -0.003 |
| 2009-11-06 | 0.019 | -0.004 |
| 2009-11-09 | 0.021 | -0.002 |
| 2009-11-10 | 0.02 | -0.002 |
| 2009-11-11 | 0.021 | 0 |
| 2009-11-12 | 0.018 | -0.003 |
| 2009-11-13 | 0.018 | -0.002 |
| 2009-11-16 | 0.02 | 0.002 |
| 2009-11-17 | 0.02 | 0.002 |
| 2009-11-18 | 0.02 | 0.001 |
| 2009-11-19 | 0.018 | -0.004 |
| 2009-11-20 | 0.017 | -0.005 |
| 2009-11-23 | 0.016 | -0.006 |
| 2009-11-24 | 0.015 | -0.009 |
| 2009-11-25 | 0.016 | -0.009 |
| 2009-11-27 | 0.015 | -0.01 |
| 2009-11-30 | 0.014 | -0.009 |
| 2009-12-01 | 0.014 | -0.009 |
| 2009-12-02 | 0.014 | -0.007 |
| 2009-12-03 | 0.014 | -0.007 |
| 2009-12-04 | 0.014 | -0.002 |
| 2009-12-07 | 0.014 | -0.003 |
| 2009-12-08 | 0.011 | -0.003 |
| 2009-12-09 | 0.011 | -0.003 |
| 2009-12-10 | 0.012 | -0.004 |
| 2009-12-11 | 0.012 | 0 |
| 2009-12-14 | 0.013 | 0.001 |
| 2009-12-15 | 0.014 | 0 |
| 2009-12-16 | 0.017 | 0.002 |
| 2009-12-17 | 0.016 | 0.002 |
| 2009-12-18 | 0.015 | 0.004 |
| 2009-12-21 | 0.017 | 0.005 |
| 2009-12-22 | 0.018 | 0.005 |
| 2009-12-23 | 0.018 | 0.006 |
| 2009-12-24 | 0.018 | 0.006 |
| 2009-12-28 | 0.016 | 0.004 |
| 2009-12-29 | 0.015 | 0.004 |
| 2009-12-30 | 0.015 | 0.003 |
| 2009-12-31 | 0.015 | 0.003 |
| 2010-01-04 | 0.016 | 0.006 |
| 2010-01-05 | 0.018 | 0.008 |
| 2010-01-06 | 0.018 | 0.009 |
| 2010-01-07 | 0.021 | 0.01 |
| 2010-01-08 | 0.021 | 0.012 |
| 2010-01-11 | 0.019 | 0.01 |
| 2010-01-12 | 0.017 | 0.007 |
| 2010-01-13 | 0.018 | 0.008 |
| 2010-01-14 | 0.019 | 0.009 |
| 2010-01-15 | 0.018 | 0.008 |
| 2010-01-19 | 0.016 | 0.009 |
| 2010-01-20 | 0.018 | 0.01 |
| 2010-01-21 | 0.018 | 0.011 |
| 2010-01-22 | 0.014 | 0.005 |
| 2010-01-25 | 0.016 | 0.006 |
| 2010-01-26 | 0.016 | 0.006 |
| 2010-01-27 | 0.016 | 0.009 |
| 2010-01-28 | 0.017 | 0.008 |
| 2010-01-29 | 0.017 | 0.006 |
| 2010-02-01 | 0.018 | 0.008 |
| 2010-02-02 | 0.017 | 0.01 |
| 2010-02-03 | 0.016 | 0.011 |
| 2010-02-04 | 0.014 | 0.008 |
| 2010-02-05 | 0.014 | 0.007 |
| 2010-02-08 | 0.013 | 0.01 |
| 2010-02-09 | 0.013 | 0.011 |
| 2010-02-10 | 0.015 | 0.012 |
| 2010-02-11 | 0.012 | 0.013 |
| 2010-02-12 | 0.009 | 0.013 |
| 2010-02-16 | 0.01 | 0.015 |
| 2010-02-17 | 0.008 | 0.014 |
| 2010-02-18 | 0.006 | 0.014 |
| 2010-02-19 | 0.006 | 0.014 |
| 2010-02-22 | 0.006 | 0.014 |
| 2010-02-23 | 0.006 | 0.01 |
| 2010-02-24 | 0.006 | 0.012 |
| 2010-02-25 | 0.006 | 0.014 |
| 2010-02-26 | 0.007 | 0.016 |
| 2010-03-01 | 0.007 | 0.016 |
| 2010-03-02 | 0.006 | 0.015 |
| 2010-03-03 | 0.006 | 0.015 |
| 2010-03-04 | 0.005 | 0.014 |
| 2010-03-05 | 0.003 | 0.014 |
| 2010-03-08 | 0.004 | 0.015 |
| 2010-03-09 | 0.003 | 0.015 |
| 2010-03-10 | 0.003 | 0.016 |
| 2010-03-11 | 0.003 | 0.016 |
| 2010-03-12 | 0.002 | 0.015 |
| 2010-03-15 | 0.003 | 0.014 |
| 2010-03-16 | 0.005 | 0.015 |
| 2010-03-17 | 0.004 | 0.016 |
| 2010-03-18 | 0.005 | 0.016 |
| 2010-03-19 | 0.007 | 0.015 |
| 2010-03-22 | 0.009 | 0.018 |
| 2010-03-23 | 0.009 | 0.018 |
| 2010-03-24 | 0.007 | 0.021 |
| 2010-03-25 | 0.009 | 0.023 |
| 2010-03-26 | 0.009 | 0.023 |
| 2010-03-29 | 0.008 | 0.022 |
| 2010-03-30 | 0.007 | 0.021 |
| 2010-03-31 | 0.005 | 0.019 |
| 2010-04-01 | 0.003 | 0.018 |
| 2010-04-05 | 0.001 | 0.018 |
| 2010-04-06 | 0.001 | 0.019 |
| 2010-04-07 | 0.002 | 0.018 |
| 2010-04-08 | 0.001 | 0.02 |
| 2010-04-09 | 0 | 0.02 |
| 2010-04-12 | 0.001 | 0.02 |
| 2010-04-13 | 0.001 | 0.021 |
| 2010-04-14 | 0 | 0.021 |
| 2010-04-15 | 0 | 0.019 |
| 2010-04-16 | 0.001 | 0.018 |
| 2010-04-19 | 0.001 | 0.017 |
| 2010-04-20 | -0.001 | 0.015 |
| 2010-04-21 | -0.002 | 0.016 |
| 2010-04-22 | -0.002 | 0.015 |
| 2010-04-23 | -0.004 | 0.013 |
| 2010-04-26 | -0.005 | 0.015 |
| 2010-04-27 | -0.004 | 0.014 |
| 2010-04-28 | -0.005 | 0.014 |
| 2010-04-29 | -0.003 | 0.016 |
| 2010-04-30 | -0.003 | 0.018 |
| 2010-05-03 | -0.003 | 0.019 |
| 2010-05-04 | -0.001 | 0.019 |
| 2010-05-05 | -0.002 | 0.019 |
| 2010-05-06 | -0.003 | 0.02 |
| 2010-05-07 | -0.003 | 0.024 |
| 2010-05-10 | -0.006 | 0.021 |
| 2010-05-11 | -0.006 | 0.02 |
| 2010-05-12 | -0.006 | 0.018 |
| 2010-05-13 | -0.007 | 0.018 |
| 2010-05-14 | -0.006 | 0.019 |
| 2010-05-17 | -0.008 | 0.019 |
| 2010-05-18 | -0.008 | 0.019 |
| 2010-05-19 | -0.008 | 0.019 |
| 2010-05-20 | -0.007 | 0.021 |
| 2010-05-21 | -0.005 | 0.022 |
| 2010-05-24 | -0.003 | 0.023 |
| 2010-05-25 | -0.002 | 0.025 |
| 2010-05-26 | -0.001 | 0.026 |
| 2010-05-27 | -0.002 | 0.026 |
| 2010-05-28 | 0 | 0.027 |
| 2010-06-01 | 0.002 | 0.031 |
| 2010-06-02 | 0.001 | 0.027 |
| 2010-06-03 | 0.002 | 0.027 |
| 2010-06-04 | 0.003 | 0.028 |
| 2010-06-07 | 0.001 | 0.027 |
| 2010-06-08 | 0.001 | 0.024 |
| 2010-06-09 | 0.001 | 0.026 |
| 2010-06-10 | 0 | 0.023 |
| 2010-06-11 | 0.001 | 0.023 |
| 2010-06-14 | 0 | 0.026 |
| 2010-06-15 | 0.001 | 0.023 |
| 2010-06-16 | 0.001 | 0.021 |
| 2010-06-17 | 0.001 | 0.02 |
| 2010-06-18 | 0 | 0.019 |
| 2010-06-21 | -0.001 | 0.016 |
| 2010-06-22 | -0.002 | 0.017 |
| 2010-06-23 | 0 | 0.019 |
| 2010-06-24 | -0.002 | 0.019 |
| 2010-06-25 | -0.002 | 0.019 |
| 2010-06-28 | -0.003 | 0.019 |
| 2010-06-29 | -0.004 | 0.019 |
| 2010-06-30 | -0.004 | 0.019 |
| 2010-07-01 | -0.004 | 0.019 |
| 2010-07-02 | -0.005 | 0.018 |
| 2010-07-06 | -0.004 | 0.012 |
| 2010-07-07 | -0.003 | 0.007 |
| 2010-07-08 | -0.005 | 0.006 |
| 2010-07-09 | -0.005 | 0.007 |
| 2010-07-12 | -0.004 | 0.003 |
| 2010-07-13 | -0.006 | 0.006 |
| 2010-07-14 | -0.005 | 0.007 |
| 2010-07-15 | -0.004 | 0.005 |
| 2010-07-16 | -0.003 | 0.003 |
| 2010-07-19 | -0.003 | 0.004 |
| 2010-07-20 | -0.004 | 0.003 |
| 2010-07-21 | -0.005 | 0.003 |
| 2010-07-22 | -0.007 | 0.005 |
| 2010-07-23 | -0.007 | 0.007 |
| 2010-07-26 | -0.008 | 0.009 |
| 2010-07-27 | -0.008 | 0.008 |
| 2010-07-28 | -0.009 | 0.005 |
| 2010-07-29 | -0.009 | 0.008 |
| 2010-07-30 | -0.009 | 0.009 |
| 2010-08-02 | -0.01 | 0.009 |
| 2010-08-03 | -0.01 | 0.006 |
| 2010-08-04 | -0.009 | 0.008 |
| 2010-08-05 | -0.008 | 0.007 |
| 2010-08-06 | -0.006 | 0.007 |
| 2010-08-09 | -0.007 | 0.008 |
| 2010-08-10 | -0.008 | 0.004 |
| 2010-08-11 | -0.007 | 0.002 |
| 2010-08-12 | -0.007 | 0 |
| 2010-08-13 | -0.006 | -0.001 |
| 2010-08-16 | -0.005 | -0.001 |
| 2010-08-17 | -0.006 | -0.001 |
| 2010-08-18 | -0.005 | 0 |
| 2010-08-19 | -0.005 | 0 |
| 2010-08-20 | -0.003 | 0.002 |
| 2010-08-23 | -0.004 | 0 |
| 2010-08-24 | -0.002 | 0 |
| 2010-08-25 | -0.002 | 0.001 |
| 2010-08-26 | -0.003 | 0 |
| 2010-08-27 | -0.002 | 0 |
| 2010-08-30 | -0.004 | 0 |
| 2010-08-31 | -0.002 | 0.001 |
| 2010-09-01 | -0.001 | 0.002 |
| 2010-09-02 | 0.001 | 0.002 |
| 2010-09-03 | 0.002 | 0.003 |
| 2010-09-07 | 0.001 | 0.001 |
| 2010-09-08 | 0.002 | 0.002 |
| 2010-09-09 | 0.002 | 0 |
| 2010-09-10 | 0.002 | -0.001 |
| 2010-09-13 | 0.005 | 0.002 |
| 2010-09-14 | 0.002 | 0.001 |
| 2010-09-15 | 0.002 | 0.001 |
| 2010-09-16 | 0.003 | 0 |
| 2010-09-17 | 0.001 | 0 |
| 2010-09-20 | 0.004 | 0 |
| 2010-09-21 | 0.002 | 0 |
| 2010-09-22 | 0.002 | 0.001 |
| 2010-09-23 | 0 | 0 |
| 2010-09-24 | 0.001 | 0.001 |
| 2010-09-27 | 0.002 | 0.002 |
| 2010-09-28 | 0.002 | 0.001 |
| 2010-09-29 | 0.002 | 0.001 |
| 2010-09-30 | 0.001 | 0.001 |
| 2010-10-01 | 0.001 | 0.001 |
| 2010-10-04 | 0.001 | 0.001 |
| 2010-10-05 | 0 | 0.002 |
| 2010-10-06 | -0.002 | 0.002 |
| 2010-10-07 | -0.002 | 0.002 |
| 2010-10-08 | -0.002 | 0.003 |
| 2010-10-11 | -0.002 | 0.003 |
| 2010-10-12 | -0.001 | 0.004 |
| 2010-10-13 | -0.001 | 0.004 |
| 2010-10-14 | 0 | 0.004 |
| 2010-10-15 | 0 | 0.002 |
| 2010-10-18 | 0 | 0.004 |
| 2010-10-19 | 0 | 0.004 |
| 2010-10-20 | 0.001 | 0.004 |
| 2010-10-21 | 0.001 | 0.004 |
| 2010-10-22 | 0.002 | 0.003 |
| 2010-10-25 | 0.001 | 0.001 |
| 2010-10-26 | 0.002 | 0.004 |
| 2010-10-27 | 0.004 | 0.004 |
| 2010-10-28 | 0.001 | 0.002 |
| 2010-10-29 | 0 | 0.003 |
| 2010-11-01 | 0 | 0.003 |
| 2010-11-02 | 0 | 0.002 |
| 2010-11-03 | 0 | 0.004 |
| 2010-11-04 | 0.002 | 0.006 |
| 2010-11-05 | 0.004 | 0.007 |
| 2010-11-08 | 0.004 | 0.007 |
| 2010-11-09 | 0.003 | 0.006 |
| 2010-11-10 | 0.003 | 0.006 |
| 2010-11-11 | 0.003 | 0.005 |
| 2010-11-12 | 0.001 | 0.005 |
| 2010-11-15 | 0.002 | 0.006 |
| 2010-11-16 | 0.001 | 0.007 |
| 2010-11-17 | 0 | 0.007 |
| 2010-11-18 | 0.002 | 0.006 |
| 2010-11-19 | 0.001 | 0.006 |
| 2010-11-22 | 0 | 0.005 |
| 2010-11-23 | -0.001 | 0.005 |
| 2010-11-24 | -0.001 | 0.004 |
| 2010-11-26 | -0.001 | 0.003 |
| 2010-11-29 | 0 | 0.004 |
| 2010-11-30 | -0.001 | 0.005 |
| 2010-12-01 | -0.001 | 0.004 |
| 2010-12-02 | 0 | 0.007 |
| 2010-12-03 | 0 | 0.007 |
| 2010-12-06 | 0 | 0.006 |
| 2010-12-07 | -0.002 | 0.005 |
| 2010-12-08 | 0.002 | 0.007 |
| 2010-12-09 | 0.003 | 0.01 |
| 2010-12-10 | 0.003 | 0.009 |
| 2010-12-13 | 0.001 | 0.01 |
| 2010-12-14 | 0 | 0.006 |
| 2010-12-15 | -0.001 | 0.003 |
| 2010-12-16 | 0 | 0.003 |
| 2010-12-17 | 0.002 | 0.002 |
| 2010-12-20 | 0.002 | 0.002 |
| 2010-12-21 | 0.003 | 0.002 |
| 2010-12-22 | 0.004 | 0.003 |
| 2010-12-23 | 0.002 | 0.004 |
| 2010-12-27 | 0.003 | 0.005 |
| 2010-12-28 | 0.001 | 0.005 |
| 2010-12-29 | 0.001 | 0.005 |
| 2010-12-30 | 0 | 0.005 |
| 2010-12-31 | 0 | 0.007 |
| 2011-01-03 | 0.002 | 0.007 |
| 2011-01-04 | 0.003 | 0.007 |
| 2011-01-05 | 0.007 | 0.006 |
| 2011-01-06 | 0.008 | 0.006 |
| 2011-01-07 | 0.008 | 0.006 |
| 2011-01-10 | 0.008 | 0.005 |
| 2011-01-11 | 0.008 | 0.004 |
| 2011-01-12 | 0.008 | 0.003 |
| 2011-01-13 | 0.008 | 0.002 |
| 2011-01-14 | 0.01 | 0.002 |
| 2011-01-18 | 0.008 | 0.002 |
| 2011-01-19 | 0.003 | 0.001 |
| 2011-01-20 | 0.003 | 0.003 |
| 2011-01-21 | 0.004 | 0.003 |
| 2011-01-24 | 0.004 | 0.004 |
| 2011-01-25 | 0.004 | 0.004 |
| 2011-01-26 | 0.004 | 0.003 |
| 2011-01-27 | 0.004 | 0.004 |
| 2011-01-28 | 0 | 0.004 |
| 2011-01-31 | 0.001 | 0.001 |